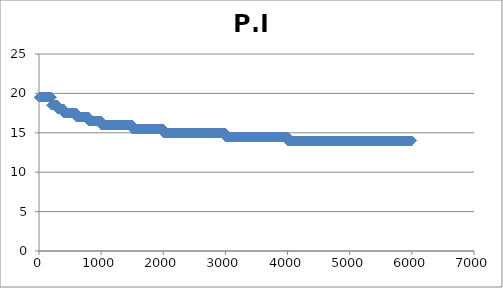
| Category | P.I |
|---|---|
| 0.0 | 19.5 |
| 1.0 | 19.5 |
| 2.0 | 19.5 |
| 3.0 | 19.5 |
| 4.0 | 19.5 |
| 5.0 | 19.5 |
| 6.0 | 19.5 |
| 7.0 | 19.5 |
| 8.0 | 19.5 |
| 9.0 | 19.5 |
| 10.0 | 19.5 |
| 11.0 | 19.5 |
| 12.0 | 19.5 |
| 13.0 | 19.5 |
| 14.0 | 19.5 |
| 15.0 | 19.5 |
| 16.0 | 19.5 |
| 17.0 | 19.5 |
| 18.0 | 19.5 |
| 19.0 | 19.5 |
| 20.0 | 19.5 |
| 21.0 | 19.5 |
| 22.0 | 19.5 |
| 23.0 | 19.5 |
| 24.0 | 19.5 |
| 25.0 | 19.5 |
| 26.0 | 19.5 |
| 27.0 | 19.5 |
| 28.0 | 19.5 |
| 29.0 | 19.5 |
| 30.0 | 19.5 |
| 31.0 | 19.5 |
| 32.0 | 19.5 |
| 33.0 | 19.5 |
| 34.0 | 19.5 |
| 35.0 | 19.5 |
| 36.0 | 19.5 |
| 37.0 | 19.5 |
| 38.0 | 19.5 |
| 39.0 | 19.5 |
| 40.0 | 19.5 |
| 41.0 | 19.5 |
| 42.0 | 19.5 |
| 43.0 | 19.5 |
| 44.0 | 19.5 |
| 45.0 | 19.5 |
| 46.0 | 19.5 |
| 47.0 | 19.5 |
| 48.0 | 19.5 |
| 49.0 | 19.5 |
| 50.0 | 19.5 |
| 51.0 | 19.5 |
| 52.0 | 19.5 |
| 53.0 | 19.5 |
| 54.0 | 19.5 |
| 55.0 | 19.5 |
| 56.0 | 19.5 |
| 57.0 | 19.5 |
| 58.0 | 19.5 |
| 59.0 | 19.5 |
| 60.0 | 19.5 |
| 61.0 | 19.5 |
| 62.0 | 19.5 |
| 63.0 | 19.5 |
| 64.0 | 19.5 |
| 65.0 | 19.5 |
| 66.0 | 19.5 |
| 67.0 | 19.5 |
| 68.0 | 19.5 |
| 69.0 | 19.5 |
| 70.0 | 19.5 |
| 71.0 | 19.5 |
| 72.0 | 19.5 |
| 73.0 | 19.5 |
| 74.0 | 19.5 |
| 75.0 | 19.5 |
| 76.0 | 19.5 |
| 77.0 | 19.5 |
| 78.0 | 19.5 |
| 79.0 | 19.5 |
| 80.0 | 19.5 |
| 81.0 | 19.5 |
| 82.0 | 19.5 |
| 83.0 | 19.5 |
| 84.0 | 19.5 |
| 85.0 | 19.5 |
| 86.0 | 19.5 |
| 87.0 | 19.5 |
| 88.0 | 19.5 |
| 89.0 | 19.5 |
| 90.0 | 19.5 |
| 91.0 | 19.5 |
| 92.0 | 19.5 |
| 93.0 | 19.5 |
| 94.0 | 19.5 |
| 95.0 | 19.5 |
| 96.0 | 19.5 |
| 97.0 | 19.5 |
| 98.0 | 19.5 |
| 99.0 | 19.5 |
| 100.0 | 19.5 |
| 101.0 | 19.5 |
| 102.0 | 19.5 |
| 103.0 | 19.5 |
| 104.0 | 19.5 |
| 105.0 | 19.5 |
| 106.0 | 19.5 |
| 107.0 | 19.5 |
| 108.0 | 19.5 |
| 109.0 | 19.5 |
| 110.0 | 19.5 |
| 111.0 | 19.5 |
| 112.0 | 19.5 |
| 113.0 | 19.5 |
| 114.0 | 19.5 |
| 115.0 | 19.5 |
| 116.0 | 19.5 |
| 117.0 | 19.5 |
| 118.0 | 19.5 |
| 119.0 | 19.5 |
| 120.0 | 19.5 |
| 121.0 | 19.5 |
| 122.0 | 19.5 |
| 123.0 | 19.5 |
| 124.0 | 19.5 |
| 125.0 | 19.5 |
| 126.0 | 19.5 |
| 127.0 | 19.5 |
| 128.0 | 19.5 |
| 129.0 | 19.5 |
| 130.0 | 19.5 |
| 131.0 | 19.5 |
| 132.0 | 19.5 |
| 133.0 | 19.5 |
| 134.0 | 19.5 |
| 135.0 | 19.5 |
| 136.0 | 19.5 |
| 137.0 | 19.5 |
| 138.0 | 19.5 |
| 139.0 | 19.5 |
| 140.0 | 19.5 |
| 141.0 | 19.5 |
| 142.0 | 19.5 |
| 143.0 | 19.5 |
| 144.0 | 19.5 |
| 145.0 | 19.5 |
| 146.0 | 19.5 |
| 147.0 | 19.5 |
| 148.0 | 19.5 |
| 149.0 | 19.5 |
| 150.0 | 19.5 |
| 151.0 | 19.5 |
| 152.0 | 19.5 |
| 153.0 | 19.5 |
| 154.0 | 19.5 |
| 155.0 | 19.5 |
| 156.0 | 19.5 |
| 157.0 | 19.5 |
| 158.0 | 19.5 |
| 159.0 | 19.5 |
| 160.0 | 19.5 |
| 161.0 | 19.5 |
| 162.0 | 19.5 |
| 163.0 | 19.5 |
| 164.0 | 19.5 |
| 165.0 | 19.5 |
| 166.0 | 19.5 |
| 167.0 | 19.5 |
| 168.0 | 19.5 |
| 169.0 | 19.5 |
| 170.0 | 19.5 |
| 171.0 | 19.5 |
| 172.0 | 19.5 |
| 173.0 | 19.5 |
| 174.0 | 19.5 |
| 175.0 | 19.5 |
| 176.0 | 19.5 |
| 177.0 | 19.5 |
| 178.0 | 19.5 |
| 179.0 | 19.5 |
| 180.0 | 19.5 |
| 181.0 | 19.5 |
| 182.0 | 19.5 |
| 183.0 | 19.5 |
| 184.0 | 19.5 |
| 185.0 | 19.5 |
| 186.0 | 19.5 |
| 187.0 | 19.5 |
| 188.0 | 19.5 |
| 189.0 | 19.5 |
| 190.0 | 19.5 |
| 191.0 | 19.5 |
| 192.0 | 19.5 |
| 193.0 | 19.5 |
| 194.0 | 19.5 |
| 195.0 | 19.5 |
| 196.0 | 19.5 |
| 197.0 | 19.5 |
| 198.0 | 19.5 |
| 199.0 | 19.5 |
| 200.0 | 19.5 |
| 201.0 | 18.5 |
| 202.0 | 18.5 |
| 203.0 | 18.5 |
| 204.0 | 18.5 |
| 205.0 | 18.5 |
| 206.0 | 18.5 |
| 207.0 | 18.5 |
| 208.0 | 18.5 |
| 209.0 | 18.5 |
| 210.0 | 18.5 |
| 211.0 | 18.5 |
| 212.0 | 18.5 |
| 213.0 | 18.5 |
| 214.0 | 18.5 |
| 215.0 | 18.5 |
| 216.0 | 18.5 |
| 217.0 | 18.5 |
| 218.0 | 18.5 |
| 219.0 | 18.5 |
| 220.0 | 18.5 |
| 221.0 | 18.5 |
| 222.0 | 18.5 |
| 223.0 | 18.5 |
| 224.0 | 18.5 |
| 225.0 | 18.5 |
| 226.0 | 18.5 |
| 227.0 | 18.5 |
| 228.0 | 18.5 |
| 229.0 | 18.5 |
| 230.0 | 18.5 |
| 231.0 | 18.5 |
| 232.0 | 18.5 |
| 233.0 | 18.5 |
| 234.0 | 18.5 |
| 235.0 | 18.5 |
| 236.0 | 18.5 |
| 237.0 | 18.5 |
| 238.0 | 18.5 |
| 239.0 | 18.5 |
| 240.0 | 18.5 |
| 241.0 | 18.5 |
| 242.0 | 18.5 |
| 243.0 | 18.5 |
| 244.0 | 18.5 |
| 245.0 | 18.5 |
| 246.0 | 18.5 |
| 247.0 | 18.5 |
| 248.0 | 18.5 |
| 249.0 | 18.5 |
| 250.0 | 18.5 |
| 251.0 | 18.5 |
| 252.0 | 18.5 |
| 253.0 | 18.5 |
| 254.0 | 18.5 |
| 255.0 | 18.5 |
| 256.0 | 18.5 |
| 257.0 | 18.5 |
| 258.0 | 18.5 |
| 259.0 | 18.5 |
| 260.0 | 18.5 |
| 261.0 | 18.5 |
| 262.0 | 18.5 |
| 263.0 | 18.5 |
| 264.0 | 18.5 |
| 265.0 | 18.5 |
| 266.0 | 18.5 |
| 267.0 | 18.5 |
| 268.0 | 18.5 |
| 269.0 | 18.5 |
| 270.0 | 18.5 |
| 271.0 | 18.5 |
| 272.0 | 18.5 |
| 273.0 | 18.5 |
| 274.0 | 18.5 |
| 275.0 | 18.5 |
| 276.0 | 18.5 |
| 277.0 | 18.5 |
| 278.0 | 18.5 |
| 279.0 | 18.5 |
| 280.0 | 18.5 |
| 281.0 | 18.5 |
| 282.0 | 18.5 |
| 283.0 | 18.5 |
| 284.0 | 18.5 |
| 285.0 | 18.5 |
| 286.0 | 18.5 |
| 287.0 | 18.5 |
| 288.0 | 18.5 |
| 289.0 | 18.5 |
| 290.0 | 18.5 |
| 291.0 | 18.5 |
| 292.0 | 18.5 |
| 293.0 | 18.5 |
| 294.0 | 18.5 |
| 295.0 | 18.5 |
| 296.0 | 18.5 |
| 297.0 | 18.5 |
| 298.0 | 18.5 |
| 299.0 | 18.5 |
| 300.0 | 18.5 |
| 301.0 | 18 |
| 302.0 | 18 |
| 303.0 | 18 |
| 304.0 | 18 |
| 305.0 | 18 |
| 306.0 | 18 |
| 307.0 | 18 |
| 308.0 | 18 |
| 309.0 | 18 |
| 310.0 | 18 |
| 311.0 | 18 |
| 312.0 | 18 |
| 313.0 | 18 |
| 314.0 | 18 |
| 315.0 | 18 |
| 316.0 | 18 |
| 317.0 | 18 |
| 318.0 | 18 |
| 319.0 | 18 |
| 320.0 | 18 |
| 321.0 | 18 |
| 322.0 | 18 |
| 323.0 | 18 |
| 324.0 | 18 |
| 325.0 | 18 |
| 326.0 | 18 |
| 327.0 | 18 |
| 328.0 | 18 |
| 329.0 | 18 |
| 330.0 | 18 |
| 331.0 | 18 |
| 332.0 | 18 |
| 333.0 | 18 |
| 334.0 | 18 |
| 335.0 | 18 |
| 336.0 | 18 |
| 337.0 | 18 |
| 338.0 | 18 |
| 339.0 | 18 |
| 340.0 | 18 |
| 341.0 | 18 |
| 342.0 | 18 |
| 343.0 | 18 |
| 344.0 | 18 |
| 345.0 | 18 |
| 346.0 | 18 |
| 347.0 | 18 |
| 348.0 | 18 |
| 349.0 | 18 |
| 350.0 | 18 |
| 351.0 | 18 |
| 352.0 | 18 |
| 353.0 | 18 |
| 354.0 | 18 |
| 355.0 | 18 |
| 356.0 | 18 |
| 357.0 | 18 |
| 358.0 | 18 |
| 359.0 | 18 |
| 360.0 | 18 |
| 361.0 | 18 |
| 362.0 | 18 |
| 363.0 | 18 |
| 364.0 | 18 |
| 365.0 | 18 |
| 366.0 | 18 |
| 367.0 | 18 |
| 368.0 | 18 |
| 369.0 | 18 |
| 370.0 | 18 |
| 371.0 | 18 |
| 372.0 | 18 |
| 373.0 | 18 |
| 374.0 | 18 |
| 375.0 | 18 |
| 376.0 | 18 |
| 377.0 | 18 |
| 378.0 | 18 |
| 379.0 | 18 |
| 380.0 | 18 |
| 381.0 | 18 |
| 382.0 | 18 |
| 383.0 | 18 |
| 384.0 | 18 |
| 385.0 | 18 |
| 386.0 | 18 |
| 387.0 | 18 |
| 388.0 | 18 |
| 389.0 | 18 |
| 390.0 | 18 |
| 391.0 | 18 |
| 392.0 | 18 |
| 393.0 | 18 |
| 394.0 | 18 |
| 395.0 | 18 |
| 396.0 | 18 |
| 397.0 | 18 |
| 398.0 | 18 |
| 399.0 | 18 |
| 400.0 | 18 |
| 401.0 | 17.5 |
| 402.0 | 17.5 |
| 403.0 | 17.5 |
| 404.0 | 17.5 |
| 405.0 | 17.5 |
| 406.0 | 17.5 |
| 407.0 | 17.5 |
| 408.0 | 17.5 |
| 409.0 | 17.5 |
| 410.0 | 17.5 |
| 411.0 | 17.5 |
| 412.0 | 17.5 |
| 413.0 | 17.5 |
| 414.0 | 17.5 |
| 415.0 | 17.5 |
| 416.0 | 17.5 |
| 417.0 | 17.5 |
| 418.0 | 17.5 |
| 419.0 | 17.5 |
| 420.0 | 17.5 |
| 421.0 | 17.5 |
| 422.0 | 17.5 |
| 423.0 | 17.5 |
| 424.0 | 17.5 |
| 425.0 | 17.5 |
| 426.0 | 17.5 |
| 427.0 | 17.5 |
| 428.0 | 17.5 |
| 429.0 | 17.5 |
| 430.0 | 17.5 |
| 431.0 | 17.5 |
| 432.0 | 17.5 |
| 433.0 | 17.5 |
| 434.0 | 17.5 |
| 435.0 | 17.5 |
| 436.0 | 17.5 |
| 437.0 | 17.5 |
| 438.0 | 17.5 |
| 439.0 | 17.5 |
| 440.0 | 17.5 |
| 441.0 | 17.5 |
| 442.0 | 17.5 |
| 443.0 | 17.5 |
| 444.0 | 17.5 |
| 445.0 | 17.5 |
| 446.0 | 17.5 |
| 447.0 | 17.5 |
| 448.0 | 17.5 |
| 449.0 | 17.5 |
| 450.0 | 17.5 |
| 451.0 | 17.5 |
| 452.0 | 17.5 |
| 453.0 | 17.5 |
| 454.0 | 17.5 |
| 455.0 | 17.5 |
| 456.0 | 17.5 |
| 457.0 | 17.5 |
| 458.0 | 17.5 |
| 459.0 | 17.5 |
| 460.0 | 17.5 |
| 461.0 | 17.5 |
| 462.0 | 17.5 |
| 463.0 | 17.5 |
| 464.0 | 17.5 |
| 465.0 | 17.5 |
| 466.0 | 17.5 |
| 467.0 | 17.5 |
| 468.0 | 17.5 |
| 469.0 | 17.5 |
| 470.0 | 17.5 |
| 471.0 | 17.5 |
| 472.0 | 17.5 |
| 473.0 | 17.5 |
| 474.0 | 17.5 |
| 475.0 | 17.5 |
| 476.0 | 17.5 |
| 477.0 | 17.5 |
| 478.0 | 17.5 |
| 479.0 | 17.5 |
| 480.0 | 17.5 |
| 481.0 | 17.5 |
| 482.0 | 17.5 |
| 483.0 | 17.5 |
| 484.0 | 17.5 |
| 485.0 | 17.5 |
| 486.0 | 17.5 |
| 487.0 | 17.5 |
| 488.0 | 17.5 |
| 489.0 | 17.5 |
| 490.0 | 17.5 |
| 491.0 | 17.5 |
| 492.0 | 17.5 |
| 493.0 | 17.5 |
| 494.0 | 17.5 |
| 495.0 | 17.5 |
| 496.0 | 17.5 |
| 497.0 | 17.5 |
| 498.0 | 17.5 |
| 499.0 | 17.5 |
| 500.0 | 17.5 |
| 501.0 | 17.5 |
| 502.0 | 17.5 |
| 503.0 | 17.5 |
| 504.0 | 17.5 |
| 505.0 | 17.5 |
| 506.0 | 17.5 |
| 507.0 | 17.5 |
| 508.0 | 17.5 |
| 509.0 | 17.5 |
| 510.0 | 17.5 |
| 511.0 | 17.5 |
| 512.0 | 17.5 |
| 513.0 | 17.5 |
| 514.0 | 17.5 |
| 515.0 | 17.5 |
| 516.0 | 17.5 |
| 517.0 | 17.5 |
| 518.0 | 17.5 |
| 519.0 | 17.5 |
| 520.0 | 17.5 |
| 521.0 | 17.5 |
| 522.0 | 17.5 |
| 523.0 | 17.5 |
| 524.0 | 17.5 |
| 525.0 | 17.5 |
| 526.0 | 17.5 |
| 527.0 | 17.5 |
| 528.0 | 17.5 |
| 529.0 | 17.5 |
| 530.0 | 17.5 |
| 531.0 | 17.5 |
| 532.0 | 17.5 |
| 533.0 | 17.5 |
| 534.0 | 17.5 |
| 535.0 | 17.5 |
| 536.0 | 17.5 |
| 537.0 | 17.5 |
| 538.0 | 17.5 |
| 539.0 | 17.5 |
| 540.0 | 17.5 |
| 541.0 | 17.5 |
| 542.0 | 17.5 |
| 543.0 | 17.5 |
| 544.0 | 17.5 |
| 545.0 | 17.5 |
| 546.0 | 17.5 |
| 547.0 | 17.5 |
| 548.0 | 17.5 |
| 549.0 | 17.5 |
| 550.0 | 17.5 |
| 551.0 | 17.5 |
| 552.0 | 17.5 |
| 553.0 | 17.5 |
| 554.0 | 17.5 |
| 555.0 | 17.5 |
| 556.0 | 17.5 |
| 557.0 | 17.5 |
| 558.0 | 17.5 |
| 559.0 | 17.5 |
| 560.0 | 17.5 |
| 561.0 | 17.5 |
| 562.0 | 17.5 |
| 563.0 | 17.5 |
| 564.0 | 17.5 |
| 565.0 | 17.5 |
| 566.0 | 17.5 |
| 567.0 | 17.5 |
| 568.0 | 17.5 |
| 569.0 | 17.5 |
| 570.0 | 17.5 |
| 571.0 | 17.5 |
| 572.0 | 17.5 |
| 573.0 | 17.5 |
| 574.0 | 17.5 |
| 575.0 | 17.5 |
| 576.0 | 17.5 |
| 577.0 | 17.5 |
| 578.0 | 17.5 |
| 579.0 | 17.5 |
| 580.0 | 17.5 |
| 581.0 | 17.5 |
| 582.0 | 17.5 |
| 583.0 | 17.5 |
| 584.0 | 17.5 |
| 585.0 | 17.5 |
| 586.0 | 17.5 |
| 587.0 | 17.5 |
| 588.0 | 17.5 |
| 589.0 | 17.5 |
| 590.0 | 17.5 |
| 591.0 | 17.5 |
| 592.0 | 17.5 |
| 593.0 | 17.5 |
| 594.0 | 17.5 |
| 595.0 | 17.5 |
| 596.0 | 17.5 |
| 597.0 | 17.5 |
| 598.0 | 17.5 |
| 599.0 | 17.5 |
| 600.0 | 17.5 |
| 601.0 | 17 |
| 602.0 | 17 |
| 603.0 | 17 |
| 604.0 | 17 |
| 605.0 | 17 |
| 606.0 | 17 |
| 607.0 | 17 |
| 608.0 | 17 |
| 609.0 | 17 |
| 610.0 | 17 |
| 611.0 | 17 |
| 612.0 | 17 |
| 613.0 | 17 |
| 614.0 | 17 |
| 615.0 | 17 |
| 616.0 | 17 |
| 617.0 | 17 |
| 618.0 | 17 |
| 619.0 | 17 |
| 620.0 | 17 |
| 621.0 | 17 |
| 622.0 | 17 |
| 623.0 | 17 |
| 624.0 | 17 |
| 625.0 | 17 |
| 626.0 | 17 |
| 627.0 | 17 |
| 628.0 | 17 |
| 629.0 | 17 |
| 630.0 | 17 |
| 631.0 | 17 |
| 632.0 | 17 |
| 633.0 | 17 |
| 634.0 | 17 |
| 635.0 | 17 |
| 636.0 | 17 |
| 637.0 | 17 |
| 638.0 | 17 |
| 639.0 | 17 |
| 640.0 | 17 |
| 641.0 | 17 |
| 642.0 | 17 |
| 643.0 | 17 |
| 644.0 | 17 |
| 645.0 | 17 |
| 646.0 | 17 |
| 647.0 | 17 |
| 648.0 | 17 |
| 649.0 | 17 |
| 650.0 | 17 |
| 651.0 | 17 |
| 652.0 | 17 |
| 653.0 | 17 |
| 654.0 | 17 |
| 655.0 | 17 |
| 656.0 | 17 |
| 657.0 | 17 |
| 658.0 | 17 |
| 659.0 | 17 |
| 660.0 | 17 |
| 661.0 | 17 |
| 662.0 | 17 |
| 663.0 | 17 |
| 664.0 | 17 |
| 665.0 | 17 |
| 666.0 | 17 |
| 667.0 | 17 |
| 668.0 | 17 |
| 669.0 | 17 |
| 670.0 | 17 |
| 671.0 | 17 |
| 672.0 | 17 |
| 673.0 | 17 |
| 674.0 | 17 |
| 675.0 | 17 |
| 676.0 | 17 |
| 677.0 | 17 |
| 678.0 | 17 |
| 679.0 | 17 |
| 680.0 | 17 |
| 681.0 | 17 |
| 682.0 | 17 |
| 683.0 | 17 |
| 684.0 | 17 |
| 685.0 | 17 |
| 686.0 | 17 |
| 687.0 | 17 |
| 688.0 | 17 |
| 689.0 | 17 |
| 690.0 | 17 |
| 691.0 | 17 |
| 692.0 | 17 |
| 693.0 | 17 |
| 694.0 | 17 |
| 695.0 | 17 |
| 696.0 | 17 |
| 697.0 | 17 |
| 698.0 | 17 |
| 699.0 | 17 |
| 700.0 | 17 |
| 701.0 | 17 |
| 702.0 | 17 |
| 703.0 | 17 |
| 704.0 | 17 |
| 705.0 | 17 |
| 706.0 | 17 |
| 707.0 | 17 |
| 708.0 | 17 |
| 709.0 | 17 |
| 710.0 | 17 |
| 711.0 | 17 |
| 712.0 | 17 |
| 713.0 | 17 |
| 714.0 | 17 |
| 715.0 | 17 |
| 716.0 | 17 |
| 717.0 | 17 |
| 718.0 | 17 |
| 719.0 | 17 |
| 720.0 | 17 |
| 721.0 | 17 |
| 722.0 | 17 |
| 723.0 | 17 |
| 724.0 | 17 |
| 725.0 | 17 |
| 726.0 | 17 |
| 727.0 | 17 |
| 728.0 | 17 |
| 729.0 | 17 |
| 730.0 | 17 |
| 731.0 | 17 |
| 732.0 | 17 |
| 733.0 | 17 |
| 734.0 | 17 |
| 735.0 | 17 |
| 736.0 | 17 |
| 737.0 | 17 |
| 738.0 | 17 |
| 739.0 | 17 |
| 740.0 | 17 |
| 741.0 | 17 |
| 742.0 | 17 |
| 743.0 | 17 |
| 744.0 | 17 |
| 745.0 | 17 |
| 746.0 | 17 |
| 747.0 | 17 |
| 748.0 | 17 |
| 749.0 | 17 |
| 750.0 | 17 |
| 751.0 | 17 |
| 752.0 | 17 |
| 753.0 | 17 |
| 754.0 | 17 |
| 755.0 | 17 |
| 756.0 | 17 |
| 757.0 | 17 |
| 758.0 | 17 |
| 759.0 | 17 |
| 760.0 | 17 |
| 761.0 | 17 |
| 762.0 | 17 |
| 763.0 | 17 |
| 764.0 | 17 |
| 765.0 | 17 |
| 766.0 | 17 |
| 767.0 | 17 |
| 768.0 | 17 |
| 769.0 | 17 |
| 770.0 | 17 |
| 771.0 | 17 |
| 772.0 | 17 |
| 773.0 | 17 |
| 774.0 | 17 |
| 775.0 | 17 |
| 776.0 | 17 |
| 777.0 | 17 |
| 778.0 | 17 |
| 779.0 | 17 |
| 780.0 | 17 |
| 781.0 | 17 |
| 782.0 | 17 |
| 783.0 | 17 |
| 784.0 | 17 |
| 785.0 | 17 |
| 786.0 | 17 |
| 787.0 | 17 |
| 788.0 | 17 |
| 789.0 | 17 |
| 790.0 | 17 |
| 791.0 | 17 |
| 792.0 | 17 |
| 793.0 | 17 |
| 794.0 | 17 |
| 795.0 | 17 |
| 796.0 | 17 |
| 797.0 | 17 |
| 798.0 | 17 |
| 799.0 | 17 |
| 800.0 | 17 |
| 801.0 | 16.5 |
| 802.0 | 16.5 |
| 803.0 | 16.5 |
| 804.0 | 16.5 |
| 805.0 | 16.5 |
| 806.0 | 16.5 |
| 807.0 | 16.5 |
| 808.0 | 16.5 |
| 809.0 | 16.5 |
| 810.0 | 16.5 |
| 811.0 | 16.5 |
| 812.0 | 16.5 |
| 813.0 | 16.5 |
| 814.0 | 16.5 |
| 815.0 | 16.5 |
| 816.0 | 16.5 |
| 817.0 | 16.5 |
| 818.0 | 16.5 |
| 819.0 | 16.5 |
| 820.0 | 16.5 |
| 821.0 | 16.5 |
| 822.0 | 16.5 |
| 823.0 | 16.5 |
| 824.0 | 16.5 |
| 825.0 | 16.5 |
| 826.0 | 16.5 |
| 827.0 | 16.5 |
| 828.0 | 16.5 |
| 829.0 | 16.5 |
| 830.0 | 16.5 |
| 831.0 | 16.5 |
| 832.0 | 16.5 |
| 833.0 | 16.5 |
| 834.0 | 16.5 |
| 835.0 | 16.5 |
| 836.0 | 16.5 |
| 837.0 | 16.5 |
| 838.0 | 16.5 |
| 839.0 | 16.5 |
| 840.0 | 16.5 |
| 841.0 | 16.5 |
| 842.0 | 16.5 |
| 843.0 | 16.5 |
| 844.0 | 16.5 |
| 845.0 | 16.5 |
| 846.0 | 16.5 |
| 847.0 | 16.5 |
| 848.0 | 16.5 |
| 849.0 | 16.5 |
| 850.0 | 16.5 |
| 851.0 | 16.5 |
| 852.0 | 16.5 |
| 853.0 | 16.5 |
| 854.0 | 16.5 |
| 855.0 | 16.5 |
| 856.0 | 16.5 |
| 857.0 | 16.5 |
| 858.0 | 16.5 |
| 859.0 | 16.5 |
| 860.0 | 16.5 |
| 861.0 | 16.5 |
| 862.0 | 16.5 |
| 863.0 | 16.5 |
| 864.0 | 16.5 |
| 865.0 | 16.5 |
| 866.0 | 16.5 |
| 867.0 | 16.5 |
| 868.0 | 16.5 |
| 869.0 | 16.5 |
| 870.0 | 16.5 |
| 871.0 | 16.5 |
| 872.0 | 16.5 |
| 873.0 | 16.5 |
| 874.0 | 16.5 |
| 875.0 | 16.5 |
| 876.0 | 16.5 |
| 877.0 | 16.5 |
| 878.0 | 16.5 |
| 879.0 | 16.5 |
| 880.0 | 16.5 |
| 881.0 | 16.5 |
| 882.0 | 16.5 |
| 883.0 | 16.5 |
| 884.0 | 16.5 |
| 885.0 | 16.5 |
| 886.0 | 16.5 |
| 887.0 | 16.5 |
| 888.0 | 16.5 |
| 889.0 | 16.5 |
| 890.0 | 16.5 |
| 891.0 | 16.5 |
| 892.0 | 16.5 |
| 893.0 | 16.5 |
| 894.0 | 16.5 |
| 895.0 | 16.5 |
| 896.0 | 16.5 |
| 897.0 | 16.5 |
| 898.0 | 16.5 |
| 899.0 | 16.5 |
| 900.0 | 16.5 |
| 901.0 | 16.5 |
| 902.0 | 16.5 |
| 903.0 | 16.5 |
| 904.0 | 16.5 |
| 905.0 | 16.5 |
| 906.0 | 16.5 |
| 907.0 | 16.5 |
| 908.0 | 16.5 |
| 909.0 | 16.5 |
| 910.0 | 16.5 |
| 911.0 | 16.5 |
| 912.0 | 16.5 |
| 913.0 | 16.5 |
| 914.0 | 16.5 |
| 915.0 | 16.5 |
| 916.0 | 16.5 |
| 917.0 | 16.5 |
| 918.0 | 16.5 |
| 919.0 | 16.5 |
| 920.0 | 16.5 |
| 921.0 | 16.5 |
| 922.0 | 16.5 |
| 923.0 | 16.5 |
| 924.0 | 16.5 |
| 925.0 | 16.5 |
| 926.0 | 16.5 |
| 927.0 | 16.5 |
| 928.0 | 16.5 |
| 929.0 | 16.5 |
| 930.0 | 16.5 |
| 931.0 | 16.5 |
| 932.0 | 16.5 |
| 933.0 | 16.5 |
| 934.0 | 16.5 |
| 935.0 | 16.5 |
| 936.0 | 16.5 |
| 937.0 | 16.5 |
| 938.0 | 16.5 |
| 939.0 | 16.5 |
| 940.0 | 16.5 |
| 941.0 | 16.5 |
| 942.0 | 16.5 |
| 943.0 | 16.5 |
| 944.0 | 16.5 |
| 945.0 | 16.5 |
| 946.0 | 16.5 |
| 947.0 | 16.5 |
| 948.0 | 16.5 |
| 949.0 | 16.5 |
| 950.0 | 16.5 |
| 951.0 | 16.5 |
| 952.0 | 16.5 |
| 953.0 | 16.5 |
| 954.0 | 16.5 |
| 955.0 | 16.5 |
| 956.0 | 16.5 |
| 957.0 | 16.5 |
| 958.0 | 16.5 |
| 959.0 | 16.5 |
| 960.0 | 16.5 |
| 961.0 | 16.5 |
| 962.0 | 16.5 |
| 963.0 | 16.5 |
| 964.0 | 16.5 |
| 965.0 | 16.5 |
| 966.0 | 16.5 |
| 967.0 | 16.5 |
| 968.0 | 16.5 |
| 969.0 | 16.5 |
| 970.0 | 16.5 |
| 971.0 | 16.5 |
| 972.0 | 16.5 |
| 973.0 | 16.5 |
| 974.0 | 16.5 |
| 975.0 | 16.5 |
| 976.0 | 16.5 |
| 977.0 | 16.5 |
| 978.0 | 16.5 |
| 979.0 | 16.5 |
| 980.0 | 16.5 |
| 981.0 | 16.5 |
| 982.0 | 16.5 |
| 983.0 | 16.5 |
| 984.0 | 16.5 |
| 985.0 | 16.5 |
| 986.0 | 16.5 |
| 987.0 | 16.5 |
| 988.0 | 16.5 |
| 989.0 | 16.5 |
| 990.0 | 16.5 |
| 991.0 | 16.5 |
| 992.0 | 16.5 |
| 993.0 | 16.5 |
| 994.0 | 16.5 |
| 995.0 | 16.5 |
| 996.0 | 16.5 |
| 997.0 | 16.5 |
| 998.0 | 16.5 |
| 999.0 | 16.5 |
| 1000.0 | 16.5 |
| 1001.0 | 16 |
| 1002.0 | 16 |
| 1003.0 | 16 |
| 1004.0 | 16 |
| 1005.0 | 16 |
| 1006.0 | 16 |
| 1007.0 | 16 |
| 1008.0 | 16 |
| 1009.0 | 16 |
| 1010.0 | 16 |
| 1011.0 | 16 |
| 1012.0 | 16 |
| 1013.0 | 16 |
| 1014.0 | 16 |
| 1015.0 | 16 |
| 1016.0 | 16 |
| 1017.0 | 16 |
| 1018.0 | 16 |
| 1019.0 | 16 |
| 1020.0 | 16 |
| 1021.0 | 16 |
| 1022.0 | 16 |
| 1023.0 | 16 |
| 1024.0 | 16 |
| 1025.0 | 16 |
| 1026.0 | 16 |
| 1027.0 | 16 |
| 1028.0 | 16 |
| 1029.0 | 16 |
| 1030.0 | 16 |
| 1031.0 | 16 |
| 1032.0 | 16 |
| 1033.0 | 16 |
| 1034.0 | 16 |
| 1035.0 | 16 |
| 1036.0 | 16 |
| 1037.0 | 16 |
| 1038.0 | 16 |
| 1039.0 | 16 |
| 1040.0 | 16 |
| 1041.0 | 16 |
| 1042.0 | 16 |
| 1043.0 | 16 |
| 1044.0 | 16 |
| 1045.0 | 16 |
| 1046.0 | 16 |
| 1047.0 | 16 |
| 1048.0 | 16 |
| 1049.0 | 16 |
| 1050.0 | 16 |
| 1051.0 | 16 |
| 1052.0 | 16 |
| 1053.0 | 16 |
| 1054.0 | 16 |
| 1055.0 | 16 |
| 1056.0 | 16 |
| 1057.0 | 16 |
| 1058.0 | 16 |
| 1059.0 | 16 |
| 1060.0 | 16 |
| 1061.0 | 16 |
| 1062.0 | 16 |
| 1063.0 | 16 |
| 1064.0 | 16 |
| 1065.0 | 16 |
| 1066.0 | 16 |
| 1067.0 | 16 |
| 1068.0 | 16 |
| 1069.0 | 16 |
| 1070.0 | 16 |
| 1071.0 | 16 |
| 1072.0 | 16 |
| 1073.0 | 16 |
| 1074.0 | 16 |
| 1075.0 | 16 |
| 1076.0 | 16 |
| 1077.0 | 16 |
| 1078.0 | 16 |
| 1079.0 | 16 |
| 1080.0 | 16 |
| 1081.0 | 16 |
| 1082.0 | 16 |
| 1083.0 | 16 |
| 1084.0 | 16 |
| 1085.0 | 16 |
| 1086.0 | 16 |
| 1087.0 | 16 |
| 1088.0 | 16 |
| 1089.0 | 16 |
| 1090.0 | 16 |
| 1091.0 | 16 |
| 1092.0 | 16 |
| 1093.0 | 16 |
| 1094.0 | 16 |
| 1095.0 | 16 |
| 1096.0 | 16 |
| 1097.0 | 16 |
| 1098.0 | 16 |
| 1099.0 | 16 |
| 1100.0 | 16 |
| 1101.0 | 16 |
| 1102.0 | 16 |
| 1103.0 | 16 |
| 1104.0 | 16 |
| 1105.0 | 16 |
| 1106.0 | 16 |
| 1107.0 | 16 |
| 1108.0 | 16 |
| 1109.0 | 16 |
| 1110.0 | 16 |
| 1111.0 | 16 |
| 1112.0 | 16 |
| 1113.0 | 16 |
| 1114.0 | 16 |
| 1115.0 | 16 |
| 1116.0 | 16 |
| 1117.0 | 16 |
| 1118.0 | 16 |
| 1119.0 | 16 |
| 1120.0 | 16 |
| 1121.0 | 16 |
| 1122.0 | 16 |
| 1123.0 | 16 |
| 1124.0 | 16 |
| 1125.0 | 16 |
| 1126.0 | 16 |
| 1127.0 | 16 |
| 1128.0 | 16 |
| 1129.0 | 16 |
| 1130.0 | 16 |
| 1131.0 | 16 |
| 1132.0 | 16 |
| 1133.0 | 16 |
| 1134.0 | 16 |
| 1135.0 | 16 |
| 1136.0 | 16 |
| 1137.0 | 16 |
| 1138.0 | 16 |
| 1139.0 | 16 |
| 1140.0 | 16 |
| 1141.0 | 16 |
| 1142.0 | 16 |
| 1143.0 | 16 |
| 1144.0 | 16 |
| 1145.0 | 16 |
| 1146.0 | 16 |
| 1147.0 | 16 |
| 1148.0 | 16 |
| 1149.0 | 16 |
| 1150.0 | 16 |
| 1151.0 | 16 |
| 1152.0 | 16 |
| 1153.0 | 16 |
| 1154.0 | 16 |
| 1155.0 | 16 |
| 1156.0 | 16 |
| 1157.0 | 16 |
| 1158.0 | 16 |
| 1159.0 | 16 |
| 1160.0 | 16 |
| 1161.0 | 16 |
| 1162.0 | 16 |
| 1163.0 | 16 |
| 1164.0 | 16 |
| 1165.0 | 16 |
| 1166.0 | 16 |
| 1167.0 | 16 |
| 1168.0 | 16 |
| 1169.0 | 16 |
| 1170.0 | 16 |
| 1171.0 | 16 |
| 1172.0 | 16 |
| 1173.0 | 16 |
| 1174.0 | 16 |
| 1175.0 | 16 |
| 1176.0 | 16 |
| 1177.0 | 16 |
| 1178.0 | 16 |
| 1179.0 | 16 |
| 1180.0 | 16 |
| 1181.0 | 16 |
| 1182.0 | 16 |
| 1183.0 | 16 |
| 1184.0 | 16 |
| 1185.0 | 16 |
| 1186.0 | 16 |
| 1187.0 | 16 |
| 1188.0 | 16 |
| 1189.0 | 16 |
| 1190.0 | 16 |
| 1191.0 | 16 |
| 1192.0 | 16 |
| 1193.0 | 16 |
| 1194.0 | 16 |
| 1195.0 | 16 |
| 1196.0 | 16 |
| 1197.0 | 16 |
| 1198.0 | 16 |
| 1199.0 | 16 |
| 1200.0 | 16 |
| 1201.0 | 16 |
| 1202.0 | 16 |
| 1203.0 | 16 |
| 1204.0 | 16 |
| 1205.0 | 16 |
| 1206.0 | 16 |
| 1207.0 | 16 |
| 1208.0 | 16 |
| 1209.0 | 16 |
| 1210.0 | 16 |
| 1211.0 | 16 |
| 1212.0 | 16 |
| 1213.0 | 16 |
| 1214.0 | 16 |
| 1215.0 | 16 |
| 1216.0 | 16 |
| 1217.0 | 16 |
| 1218.0 | 16 |
| 1219.0 | 16 |
| 1220.0 | 16 |
| 1221.0 | 16 |
| 1222.0 | 16 |
| 1223.0 | 16 |
| 1224.0 | 16 |
| 1225.0 | 16 |
| 1226.0 | 16 |
| 1227.0 | 16 |
| 1228.0 | 16 |
| 1229.0 | 16 |
| 1230.0 | 16 |
| 1231.0 | 16 |
| 1232.0 | 16 |
| 1233.0 | 16 |
| 1234.0 | 16 |
| 1235.0 | 16 |
| 1236.0 | 16 |
| 1237.0 | 16 |
| 1238.0 | 16 |
| 1239.0 | 16 |
| 1240.0 | 16 |
| 1241.0 | 16 |
| 1242.0 | 16 |
| 1243.0 | 16 |
| 1244.0 | 16 |
| 1245.0 | 16 |
| 1246.0 | 16 |
| 1247.0 | 16 |
| 1248.0 | 16 |
| 1249.0 | 16 |
| 1250.0 | 16 |
| 1251.0 | 16 |
| 1252.0 | 16 |
| 1253.0 | 16 |
| 1254.0 | 16 |
| 1255.0 | 16 |
| 1256.0 | 16 |
| 1257.0 | 16 |
| 1258.0 | 16 |
| 1259.0 | 16 |
| 1260.0 | 16 |
| 1261.0 | 16 |
| 1262.0 | 16 |
| 1263.0 | 16 |
| 1264.0 | 16 |
| 1265.0 | 16 |
| 1266.0 | 16 |
| 1267.0 | 16 |
| 1268.0 | 16 |
| 1269.0 | 16 |
| 1270.0 | 16 |
| 1271.0 | 16 |
| 1272.0 | 16 |
| 1273.0 | 16 |
| 1274.0 | 16 |
| 1275.0 | 16 |
| 1276.0 | 16 |
| 1277.0 | 16 |
| 1278.0 | 16 |
| 1279.0 | 16 |
| 1280.0 | 16 |
| 1281.0 | 16 |
| 1282.0 | 16 |
| 1283.0 | 16 |
| 1284.0 | 16 |
| 1285.0 | 16 |
| 1286.0 | 16 |
| 1287.0 | 16 |
| 1288.0 | 16 |
| 1289.0 | 16 |
| 1290.0 | 16 |
| 1291.0 | 16 |
| 1292.0 | 16 |
| 1293.0 | 16 |
| 1294.0 | 16 |
| 1295.0 | 16 |
| 1296.0 | 16 |
| 1297.0 | 16 |
| 1298.0 | 16 |
| 1299.0 | 16 |
| 1300.0 | 16 |
| 1301.0 | 16 |
| 1302.0 | 16 |
| 1303.0 | 16 |
| 1304.0 | 16 |
| 1305.0 | 16 |
| 1306.0 | 16 |
| 1307.0 | 16 |
| 1308.0 | 16 |
| 1309.0 | 16 |
| 1310.0 | 16 |
| 1311.0 | 16 |
| 1312.0 | 16 |
| 1313.0 | 16 |
| 1314.0 | 16 |
| 1315.0 | 16 |
| 1316.0 | 16 |
| 1317.0 | 16 |
| 1318.0 | 16 |
| 1319.0 | 16 |
| 1320.0 | 16 |
| 1321.0 | 16 |
| 1322.0 | 16 |
| 1323.0 | 16 |
| 1324.0 | 16 |
| 1325.0 | 16 |
| 1326.0 | 16 |
| 1327.0 | 16 |
| 1328.0 | 16 |
| 1329.0 | 16 |
| 1330.0 | 16 |
| 1331.0 | 16 |
| 1332.0 | 16 |
| 1333.0 | 16 |
| 1334.0 | 16 |
| 1335.0 | 16 |
| 1336.0 | 16 |
| 1337.0 | 16 |
| 1338.0 | 16 |
| 1339.0 | 16 |
| 1340.0 | 16 |
| 1341.0 | 16 |
| 1342.0 | 16 |
| 1343.0 | 16 |
| 1344.0 | 16 |
| 1345.0 | 16 |
| 1346.0 | 16 |
| 1347.0 | 16 |
| 1348.0 | 16 |
| 1349.0 | 16 |
| 1350.0 | 16 |
| 1351.0 | 16 |
| 1352.0 | 16 |
| 1353.0 | 16 |
| 1354.0 | 16 |
| 1355.0 | 16 |
| 1356.0 | 16 |
| 1357.0 | 16 |
| 1358.0 | 16 |
| 1359.0 | 16 |
| 1360.0 | 16 |
| 1361.0 | 16 |
| 1362.0 | 16 |
| 1363.0 | 16 |
| 1364.0 | 16 |
| 1365.0 | 16 |
| 1366.0 | 16 |
| 1367.0 | 16 |
| 1368.0 | 16 |
| 1369.0 | 16 |
| 1370.0 | 16 |
| 1371.0 | 16 |
| 1372.0 | 16 |
| 1373.0 | 16 |
| 1374.0 | 16 |
| 1375.0 | 16 |
| 1376.0 | 16 |
| 1377.0 | 16 |
| 1378.0 | 16 |
| 1379.0 | 16 |
| 1380.0 | 16 |
| 1381.0 | 16 |
| 1382.0 | 16 |
| 1383.0 | 16 |
| 1384.0 | 16 |
| 1385.0 | 16 |
| 1386.0 | 16 |
| 1387.0 | 16 |
| 1388.0 | 16 |
| 1389.0 | 16 |
| 1390.0 | 16 |
| 1391.0 | 16 |
| 1392.0 | 16 |
| 1393.0 | 16 |
| 1394.0 | 16 |
| 1395.0 | 16 |
| 1396.0 | 16 |
| 1397.0 | 16 |
| 1398.0 | 16 |
| 1399.0 | 16 |
| 1400.0 | 16 |
| 1401.0 | 16 |
| 1402.0 | 16 |
| 1403.0 | 16 |
| 1404.0 | 16 |
| 1405.0 | 16 |
| 1406.0 | 16 |
| 1407.0 | 16 |
| 1408.0 | 16 |
| 1409.0 | 16 |
| 1410.0 | 16 |
| 1411.0 | 16 |
| 1412.0 | 16 |
| 1413.0 | 16 |
| 1414.0 | 16 |
| 1415.0 | 16 |
| 1416.0 | 16 |
| 1417.0 | 16 |
| 1418.0 | 16 |
| 1419.0 | 16 |
| 1420.0 | 16 |
| 1421.0 | 16 |
| 1422.0 | 16 |
| 1423.0 | 16 |
| 1424.0 | 16 |
| 1425.0 | 16 |
| 1426.0 | 16 |
| 1427.0 | 16 |
| 1428.0 | 16 |
| 1429.0 | 16 |
| 1430.0 | 16 |
| 1431.0 | 16 |
| 1432.0 | 16 |
| 1433.0 | 16 |
| 1434.0 | 16 |
| 1435.0 | 16 |
| 1436.0 | 16 |
| 1437.0 | 16 |
| 1438.0 | 16 |
| 1439.0 | 16 |
| 1440.0 | 16 |
| 1441.0 | 16 |
| 1442.0 | 16 |
| 1443.0 | 16 |
| 1444.0 | 16 |
| 1445.0 | 16 |
| 1446.0 | 16 |
| 1447.0 | 16 |
| 1448.0 | 16 |
| 1449.0 | 16 |
| 1450.0 | 16 |
| 1451.0 | 16 |
| 1452.0 | 16 |
| 1453.0 | 16 |
| 1454.0 | 16 |
| 1455.0 | 16 |
| 1456.0 | 16 |
| 1457.0 | 16 |
| 1458.0 | 16 |
| 1459.0 | 16 |
| 1460.0 | 16 |
| 1461.0 | 16 |
| 1462.0 | 16 |
| 1463.0 | 16 |
| 1464.0 | 16 |
| 1465.0 | 16 |
| 1466.0 | 16 |
| 1467.0 | 16 |
| 1468.0 | 16 |
| 1469.0 | 16 |
| 1470.0 | 16 |
| 1471.0 | 16 |
| 1472.0 | 16 |
| 1473.0 | 16 |
| 1474.0 | 16 |
| 1475.0 | 16 |
| 1476.0 | 16 |
| 1477.0 | 16 |
| 1478.0 | 16 |
| 1479.0 | 16 |
| 1480.0 | 16 |
| 1481.0 | 16 |
| 1482.0 | 16 |
| 1483.0 | 16 |
| 1484.0 | 16 |
| 1485.0 | 16 |
| 1486.0 | 16 |
| 1487.0 | 16 |
| 1488.0 | 16 |
| 1489.0 | 16 |
| 1490.0 | 16 |
| 1491.0 | 16 |
| 1492.0 | 16 |
| 1493.0 | 16 |
| 1494.0 | 16 |
| 1495.0 | 16 |
| 1496.0 | 16 |
| 1497.0 | 16 |
| 1498.0 | 16 |
| 1499.0 | 16 |
| 1500.0 | 16 |
| 1501.0 | 15.5 |
| 1502.0 | 15.5 |
| 1503.0 | 15.5 |
| 1504.0 | 15.5 |
| 1505.0 | 15.5 |
| 1506.0 | 15.5 |
| 1507.0 | 15.5 |
| 1508.0 | 15.5 |
| 1509.0 | 15.5 |
| 1510.0 | 15.5 |
| 1511.0 | 15.5 |
| 1512.0 | 15.5 |
| 1513.0 | 15.5 |
| 1514.0 | 15.5 |
| 1515.0 | 15.5 |
| 1516.0 | 15.5 |
| 1517.0 | 15.5 |
| 1518.0 | 15.5 |
| 1519.0 | 15.5 |
| 1520.0 | 15.5 |
| 1521.0 | 15.5 |
| 1522.0 | 15.5 |
| 1523.0 | 15.5 |
| 1524.0 | 15.5 |
| 1525.0 | 15.5 |
| 1526.0 | 15.5 |
| 1527.0 | 15.5 |
| 1528.0 | 15.5 |
| 1529.0 | 15.5 |
| 1530.0 | 15.5 |
| 1531.0 | 15.5 |
| 1532.0 | 15.5 |
| 1533.0 | 15.5 |
| 1534.0 | 15.5 |
| 1535.0 | 15.5 |
| 1536.0 | 15.5 |
| 1537.0 | 15.5 |
| 1538.0 | 15.5 |
| 1539.0 | 15.5 |
| 1540.0 | 15.5 |
| 1541.0 | 15.5 |
| 1542.0 | 15.5 |
| 1543.0 | 15.5 |
| 1544.0 | 15.5 |
| 1545.0 | 15.5 |
| 1546.0 | 15.5 |
| 1547.0 | 15.5 |
| 1548.0 | 15.5 |
| 1549.0 | 15.5 |
| 1550.0 | 15.5 |
| 1551.0 | 15.5 |
| 1552.0 | 15.5 |
| 1553.0 | 15.5 |
| 1554.0 | 15.5 |
| 1555.0 | 15.5 |
| 1556.0 | 15.5 |
| 1557.0 | 15.5 |
| 1558.0 | 15.5 |
| 1559.0 | 15.5 |
| 1560.0 | 15.5 |
| 1561.0 | 15.5 |
| 1562.0 | 15.5 |
| 1563.0 | 15.5 |
| 1564.0 | 15.5 |
| 1565.0 | 15.5 |
| 1566.0 | 15.5 |
| 1567.0 | 15.5 |
| 1568.0 | 15.5 |
| 1569.0 | 15.5 |
| 1570.0 | 15.5 |
| 1571.0 | 15.5 |
| 1572.0 | 15.5 |
| 1573.0 | 15.5 |
| 1574.0 | 15.5 |
| 1575.0 | 15.5 |
| 1576.0 | 15.5 |
| 1577.0 | 15.5 |
| 1578.0 | 15.5 |
| 1579.0 | 15.5 |
| 1580.0 | 15.5 |
| 1581.0 | 15.5 |
| 1582.0 | 15.5 |
| 1583.0 | 15.5 |
| 1584.0 | 15.5 |
| 1585.0 | 15.5 |
| 1586.0 | 15.5 |
| 1587.0 | 15.5 |
| 1588.0 | 15.5 |
| 1589.0 | 15.5 |
| 1590.0 | 15.5 |
| 1591.0 | 15.5 |
| 1592.0 | 15.5 |
| 1593.0 | 15.5 |
| 1594.0 | 15.5 |
| 1595.0 | 15.5 |
| 1596.0 | 15.5 |
| 1597.0 | 15.5 |
| 1598.0 | 15.5 |
| 1599.0 | 15.5 |
| 1600.0 | 15.5 |
| 1601.0 | 15.5 |
| 1602.0 | 15.5 |
| 1603.0 | 15.5 |
| 1604.0 | 15.5 |
| 1605.0 | 15.5 |
| 1606.0 | 15.5 |
| 1607.0 | 15.5 |
| 1608.0 | 15.5 |
| 1609.0 | 15.5 |
| 1610.0 | 15.5 |
| 1611.0 | 15.5 |
| 1612.0 | 15.5 |
| 1613.0 | 15.5 |
| 1614.0 | 15.5 |
| 1615.0 | 15.5 |
| 1616.0 | 15.5 |
| 1617.0 | 15.5 |
| 1618.0 | 15.5 |
| 1619.0 | 15.5 |
| 1620.0 | 15.5 |
| 1621.0 | 15.5 |
| 1622.0 | 15.5 |
| 1623.0 | 15.5 |
| 1624.0 | 15.5 |
| 1625.0 | 15.5 |
| 1626.0 | 15.5 |
| 1627.0 | 15.5 |
| 1628.0 | 15.5 |
| 1629.0 | 15.5 |
| 1630.0 | 15.5 |
| 1631.0 | 15.5 |
| 1632.0 | 15.5 |
| 1633.0 | 15.5 |
| 1634.0 | 15.5 |
| 1635.0 | 15.5 |
| 1636.0 | 15.5 |
| 1637.0 | 15.5 |
| 1638.0 | 15.5 |
| 1639.0 | 15.5 |
| 1640.0 | 15.5 |
| 1641.0 | 15.5 |
| 1642.0 | 15.5 |
| 1643.0 | 15.5 |
| 1644.0 | 15.5 |
| 1645.0 | 15.5 |
| 1646.0 | 15.5 |
| 1647.0 | 15.5 |
| 1648.0 | 15.5 |
| 1649.0 | 15.5 |
| 1650.0 | 15.5 |
| 1651.0 | 15.5 |
| 1652.0 | 15.5 |
| 1653.0 | 15.5 |
| 1654.0 | 15.5 |
| 1655.0 | 15.5 |
| 1656.0 | 15.5 |
| 1657.0 | 15.5 |
| 1658.0 | 15.5 |
| 1659.0 | 15.5 |
| 1660.0 | 15.5 |
| 1661.0 | 15.5 |
| 1662.0 | 15.5 |
| 1663.0 | 15.5 |
| 1664.0 | 15.5 |
| 1665.0 | 15.5 |
| 1666.0 | 15.5 |
| 1667.0 | 15.5 |
| 1668.0 | 15.5 |
| 1669.0 | 15.5 |
| 1670.0 | 15.5 |
| 1671.0 | 15.5 |
| 1672.0 | 15.5 |
| 1673.0 | 15.5 |
| 1674.0 | 15.5 |
| 1675.0 | 15.5 |
| 1676.0 | 15.5 |
| 1677.0 | 15.5 |
| 1678.0 | 15.5 |
| 1679.0 | 15.5 |
| 1680.0 | 15.5 |
| 1681.0 | 15.5 |
| 1682.0 | 15.5 |
| 1683.0 | 15.5 |
| 1684.0 | 15.5 |
| 1685.0 | 15.5 |
| 1686.0 | 15.5 |
| 1687.0 | 15.5 |
| 1688.0 | 15.5 |
| 1689.0 | 15.5 |
| 1690.0 | 15.5 |
| 1691.0 | 15.5 |
| 1692.0 | 15.5 |
| 1693.0 | 15.5 |
| 1694.0 | 15.5 |
| 1695.0 | 15.5 |
| 1696.0 | 15.5 |
| 1697.0 | 15.5 |
| 1698.0 | 15.5 |
| 1699.0 | 15.5 |
| 1700.0 | 15.5 |
| 1701.0 | 15.5 |
| 1702.0 | 15.5 |
| 1703.0 | 15.5 |
| 1704.0 | 15.5 |
| 1705.0 | 15.5 |
| 1706.0 | 15.5 |
| 1707.0 | 15.5 |
| 1708.0 | 15.5 |
| 1709.0 | 15.5 |
| 1710.0 | 15.5 |
| 1711.0 | 15.5 |
| 1712.0 | 15.5 |
| 1713.0 | 15.5 |
| 1714.0 | 15.5 |
| 1715.0 | 15.5 |
| 1716.0 | 15.5 |
| 1717.0 | 15.5 |
| 1718.0 | 15.5 |
| 1719.0 | 15.5 |
| 1720.0 | 15.5 |
| 1721.0 | 15.5 |
| 1722.0 | 15.5 |
| 1723.0 | 15.5 |
| 1724.0 | 15.5 |
| 1725.0 | 15.5 |
| 1726.0 | 15.5 |
| 1727.0 | 15.5 |
| 1728.0 | 15.5 |
| 1729.0 | 15.5 |
| 1730.0 | 15.5 |
| 1731.0 | 15.5 |
| 1732.0 | 15.5 |
| 1733.0 | 15.5 |
| 1734.0 | 15.5 |
| 1735.0 | 15.5 |
| 1736.0 | 15.5 |
| 1737.0 | 15.5 |
| 1738.0 | 15.5 |
| 1739.0 | 15.5 |
| 1740.0 | 15.5 |
| 1741.0 | 15.5 |
| 1742.0 | 15.5 |
| 1743.0 | 15.5 |
| 1744.0 | 15.5 |
| 1745.0 | 15.5 |
| 1746.0 | 15.5 |
| 1747.0 | 15.5 |
| 1748.0 | 15.5 |
| 1749.0 | 15.5 |
| 1750.0 | 15.5 |
| 1751.0 | 15.5 |
| 1752.0 | 15.5 |
| 1753.0 | 15.5 |
| 1754.0 | 15.5 |
| 1755.0 | 15.5 |
| 1756.0 | 15.5 |
| 1757.0 | 15.5 |
| 1758.0 | 15.5 |
| 1759.0 | 15.5 |
| 1760.0 | 15.5 |
| 1761.0 | 15.5 |
| 1762.0 | 15.5 |
| 1763.0 | 15.5 |
| 1764.0 | 15.5 |
| 1765.0 | 15.5 |
| 1766.0 | 15.5 |
| 1767.0 | 15.5 |
| 1768.0 | 15.5 |
| 1769.0 | 15.5 |
| 1770.0 | 15.5 |
| 1771.0 | 15.5 |
| 1772.0 | 15.5 |
| 1773.0 | 15.5 |
| 1774.0 | 15.5 |
| 1775.0 | 15.5 |
| 1776.0 | 15.5 |
| 1777.0 | 15.5 |
| 1778.0 | 15.5 |
| 1779.0 | 15.5 |
| 1780.0 | 15.5 |
| 1781.0 | 15.5 |
| 1782.0 | 15.5 |
| 1783.0 | 15.5 |
| 1784.0 | 15.5 |
| 1785.0 | 15.5 |
| 1786.0 | 15.5 |
| 1787.0 | 15.5 |
| 1788.0 | 15.5 |
| 1789.0 | 15.5 |
| 1790.0 | 15.5 |
| 1791.0 | 15.5 |
| 1792.0 | 15.5 |
| 1793.0 | 15.5 |
| 1794.0 | 15.5 |
| 1795.0 | 15.5 |
| 1796.0 | 15.5 |
| 1797.0 | 15.5 |
| 1798.0 | 15.5 |
| 1799.0 | 15.5 |
| 1800.0 | 15.5 |
| 1801.0 | 15.5 |
| 1802.0 | 15.5 |
| 1803.0 | 15.5 |
| 1804.0 | 15.5 |
| 1805.0 | 15.5 |
| 1806.0 | 15.5 |
| 1807.0 | 15.5 |
| 1808.0 | 15.5 |
| 1809.0 | 15.5 |
| 1810.0 | 15.5 |
| 1811.0 | 15.5 |
| 1812.0 | 15.5 |
| 1813.0 | 15.5 |
| 1814.0 | 15.5 |
| 1815.0 | 15.5 |
| 1816.0 | 15.5 |
| 1817.0 | 15.5 |
| 1818.0 | 15.5 |
| 1819.0 | 15.5 |
| 1820.0 | 15.5 |
| 1821.0 | 15.5 |
| 1822.0 | 15.5 |
| 1823.0 | 15.5 |
| 1824.0 | 15.5 |
| 1825.0 | 15.5 |
| 1826.0 | 15.5 |
| 1827.0 | 15.5 |
| 1828.0 | 15.5 |
| 1829.0 | 15.5 |
| 1830.0 | 15.5 |
| 1831.0 | 15.5 |
| 1832.0 | 15.5 |
| 1833.0 | 15.5 |
| 1834.0 | 15.5 |
| 1835.0 | 15.5 |
| 1836.0 | 15.5 |
| 1837.0 | 15.5 |
| 1838.0 | 15.5 |
| 1839.0 | 15.5 |
| 1840.0 | 15.5 |
| 1841.0 | 15.5 |
| 1842.0 | 15.5 |
| 1843.0 | 15.5 |
| 1844.0 | 15.5 |
| 1845.0 | 15.5 |
| 1846.0 | 15.5 |
| 1847.0 | 15.5 |
| 1848.0 | 15.5 |
| 1849.0 | 15.5 |
| 1850.0 | 15.5 |
| 1851.0 | 15.5 |
| 1852.0 | 15.5 |
| 1853.0 | 15.5 |
| 1854.0 | 15.5 |
| 1855.0 | 15.5 |
| 1856.0 | 15.5 |
| 1857.0 | 15.5 |
| 1858.0 | 15.5 |
| 1859.0 | 15.5 |
| 1860.0 | 15.5 |
| 1861.0 | 15.5 |
| 1862.0 | 15.5 |
| 1863.0 | 15.5 |
| 1864.0 | 15.5 |
| 1865.0 | 15.5 |
| 1866.0 | 15.5 |
| 1867.0 | 15.5 |
| 1868.0 | 15.5 |
| 1869.0 | 15.5 |
| 1870.0 | 15.5 |
| 1871.0 | 15.5 |
| 1872.0 | 15.5 |
| 1873.0 | 15.5 |
| 1874.0 | 15.5 |
| 1875.0 | 15.5 |
| 1876.0 | 15.5 |
| 1877.0 | 15.5 |
| 1878.0 | 15.5 |
| 1879.0 | 15.5 |
| 1880.0 | 15.5 |
| 1881.0 | 15.5 |
| 1882.0 | 15.5 |
| 1883.0 | 15.5 |
| 1884.0 | 15.5 |
| 1885.0 | 15.5 |
| 1886.0 | 15.5 |
| 1887.0 | 15.5 |
| 1888.0 | 15.5 |
| 1889.0 | 15.5 |
| 1890.0 | 15.5 |
| 1891.0 | 15.5 |
| 1892.0 | 15.5 |
| 1893.0 | 15.5 |
| 1894.0 | 15.5 |
| 1895.0 | 15.5 |
| 1896.0 | 15.5 |
| 1897.0 | 15.5 |
| 1898.0 | 15.5 |
| 1899.0 | 15.5 |
| 1900.0 | 15.5 |
| 1901.0 | 15.5 |
| 1902.0 | 15.5 |
| 1903.0 | 15.5 |
| 1904.0 | 15.5 |
| 1905.0 | 15.5 |
| 1906.0 | 15.5 |
| 1907.0 | 15.5 |
| 1908.0 | 15.5 |
| 1909.0 | 15.5 |
| 1910.0 | 15.5 |
| 1911.0 | 15.5 |
| 1912.0 | 15.5 |
| 1913.0 | 15.5 |
| 1914.0 | 15.5 |
| 1915.0 | 15.5 |
| 1916.0 | 15.5 |
| 1917.0 | 15.5 |
| 1918.0 | 15.5 |
| 1919.0 | 15.5 |
| 1920.0 | 15.5 |
| 1921.0 | 15.5 |
| 1922.0 | 15.5 |
| 1923.0 | 15.5 |
| 1924.0 | 15.5 |
| 1925.0 | 15.5 |
| 1926.0 | 15.5 |
| 1927.0 | 15.5 |
| 1928.0 | 15.5 |
| 1929.0 | 15.5 |
| 1930.0 | 15.5 |
| 1931.0 | 15.5 |
| 1932.0 | 15.5 |
| 1933.0 | 15.5 |
| 1934.0 | 15.5 |
| 1935.0 | 15.5 |
| 1936.0 | 15.5 |
| 1937.0 | 15.5 |
| 1938.0 | 15.5 |
| 1939.0 | 15.5 |
| 1940.0 | 15.5 |
| 1941.0 | 15.5 |
| 1942.0 | 15.5 |
| 1943.0 | 15.5 |
| 1944.0 | 15.5 |
| 1945.0 | 15.5 |
| 1946.0 | 15.5 |
| 1947.0 | 15.5 |
| 1948.0 | 15.5 |
| 1949.0 | 15.5 |
| 1950.0 | 15.5 |
| 1951.0 | 15.5 |
| 1952.0 | 15.5 |
| 1953.0 | 15.5 |
| 1954.0 | 15.5 |
| 1955.0 | 15.5 |
| 1956.0 | 15.5 |
| 1957.0 | 15.5 |
| 1958.0 | 15.5 |
| 1959.0 | 15.5 |
| 1960.0 | 15.5 |
| 1961.0 | 15.5 |
| 1962.0 | 15.5 |
| 1963.0 | 15.5 |
| 1964.0 | 15.5 |
| 1965.0 | 15.5 |
| 1966.0 | 15.5 |
| 1967.0 | 15.5 |
| 1968.0 | 15.5 |
| 1969.0 | 15.5 |
| 1970.0 | 15.5 |
| 1971.0 | 15.5 |
| 1972.0 | 15.5 |
| 1973.0 | 15.5 |
| 1974.0 | 15.5 |
| 1975.0 | 15.5 |
| 1976.0 | 15.5 |
| 1977.0 | 15.5 |
| 1978.0 | 15.5 |
| 1979.0 | 15.5 |
| 1980.0 | 15.5 |
| 1981.0 | 15.5 |
| 1982.0 | 15.5 |
| 1983.0 | 15.5 |
| 1984.0 | 15.5 |
| 1985.0 | 15.5 |
| 1986.0 | 15.5 |
| 1987.0 | 15.5 |
| 1988.0 | 15.5 |
| 1989.0 | 15.5 |
| 1990.0 | 15.5 |
| 1991.0 | 15.5 |
| 1992.0 | 15.5 |
| 1993.0 | 15.5 |
| 1994.0 | 15.5 |
| 1995.0 | 15.5 |
| 1996.0 | 15.5 |
| 1997.0 | 15.5 |
| 1998.0 | 15.5 |
| 1999.0 | 15.5 |
| 2000.0 | 15.5 |
| 2001.0 | 15 |
| 2002.0 | 15 |
| 2003.0 | 15 |
| 2004.0 | 15 |
| 2005.0 | 15 |
| 2006.0 | 15 |
| 2007.0 | 15 |
| 2008.0 | 15 |
| 2009.0 | 15 |
| 2010.0 | 15 |
| 2011.0 | 15 |
| 2012.0 | 15 |
| 2013.0 | 15 |
| 2014.0 | 15 |
| 2015.0 | 15 |
| 2016.0 | 15 |
| 2017.0 | 15 |
| 2018.0 | 15 |
| 2019.0 | 15 |
| 2020.0 | 15 |
| 2021.0 | 15 |
| 2022.0 | 15 |
| 2023.0 | 15 |
| 2024.0 | 15 |
| 2025.0 | 15 |
| 2026.0 | 15 |
| 2027.0 | 15 |
| 2028.0 | 15 |
| 2029.0 | 15 |
| 2030.0 | 15 |
| 2031.0 | 15 |
| 2032.0 | 15 |
| 2033.0 | 15 |
| 2034.0 | 15 |
| 2035.0 | 15 |
| 2036.0 | 15 |
| 2037.0 | 15 |
| 2038.0 | 15 |
| 2039.0 | 15 |
| 2040.0 | 15 |
| 2041.0 | 15 |
| 2042.0 | 15 |
| 2043.0 | 15 |
| 2044.0 | 15 |
| 2045.0 | 15 |
| 2046.0 | 15 |
| 2047.0 | 15 |
| 2048.0 | 15 |
| 2049.0 | 15 |
| 2050.0 | 15 |
| 2051.0 | 15 |
| 2052.0 | 15 |
| 2053.0 | 15 |
| 2054.0 | 15 |
| 2055.0 | 15 |
| 2056.0 | 15 |
| 2057.0 | 15 |
| 2058.0 | 15 |
| 2059.0 | 15 |
| 2060.0 | 15 |
| 2061.0 | 15 |
| 2062.0 | 15 |
| 2063.0 | 15 |
| 2064.0 | 15 |
| 2065.0 | 15 |
| 2066.0 | 15 |
| 2067.0 | 15 |
| 2068.0 | 15 |
| 2069.0 | 15 |
| 2070.0 | 15 |
| 2071.0 | 15 |
| 2072.0 | 15 |
| 2073.0 | 15 |
| 2074.0 | 15 |
| 2075.0 | 15 |
| 2076.0 | 15 |
| 2077.0 | 15 |
| 2078.0 | 15 |
| 2079.0 | 15 |
| 2080.0 | 15 |
| 2081.0 | 15 |
| 2082.0 | 15 |
| 2083.0 | 15 |
| 2084.0 | 15 |
| 2085.0 | 15 |
| 2086.0 | 15 |
| 2087.0 | 15 |
| 2088.0 | 15 |
| 2089.0 | 15 |
| 2090.0 | 15 |
| 2091.0 | 15 |
| 2092.0 | 15 |
| 2093.0 | 15 |
| 2094.0 | 15 |
| 2095.0 | 15 |
| 2096.0 | 15 |
| 2097.0 | 15 |
| 2098.0 | 15 |
| 2099.0 | 15 |
| 2100.0 | 15 |
| 2101.0 | 15 |
| 2102.0 | 15 |
| 2103.0 | 15 |
| 2104.0 | 15 |
| 2105.0 | 15 |
| 2106.0 | 15 |
| 2107.0 | 15 |
| 2108.0 | 15 |
| 2109.0 | 15 |
| 2110.0 | 15 |
| 2111.0 | 15 |
| 2112.0 | 15 |
| 2113.0 | 15 |
| 2114.0 | 15 |
| 2115.0 | 15 |
| 2116.0 | 15 |
| 2117.0 | 15 |
| 2118.0 | 15 |
| 2119.0 | 15 |
| 2120.0 | 15 |
| 2121.0 | 15 |
| 2122.0 | 15 |
| 2123.0 | 15 |
| 2124.0 | 15 |
| 2125.0 | 15 |
| 2126.0 | 15 |
| 2127.0 | 15 |
| 2128.0 | 15 |
| 2129.0 | 15 |
| 2130.0 | 15 |
| 2131.0 | 15 |
| 2132.0 | 15 |
| 2133.0 | 15 |
| 2134.0 | 15 |
| 2135.0 | 15 |
| 2136.0 | 15 |
| 2137.0 | 15 |
| 2138.0 | 15 |
| 2139.0 | 15 |
| 2140.0 | 15 |
| 2141.0 | 15 |
| 2142.0 | 15 |
| 2143.0 | 15 |
| 2144.0 | 15 |
| 2145.0 | 15 |
| 2146.0 | 15 |
| 2147.0 | 15 |
| 2148.0 | 15 |
| 2149.0 | 15 |
| 2150.0 | 15 |
| 2151.0 | 15 |
| 2152.0 | 15 |
| 2153.0 | 15 |
| 2154.0 | 15 |
| 2155.0 | 15 |
| 2156.0 | 15 |
| 2157.0 | 15 |
| 2158.0 | 15 |
| 2159.0 | 15 |
| 2160.0 | 15 |
| 2161.0 | 15 |
| 2162.0 | 15 |
| 2163.0 | 15 |
| 2164.0 | 15 |
| 2165.0 | 15 |
| 2166.0 | 15 |
| 2167.0 | 15 |
| 2168.0 | 15 |
| 2169.0 | 15 |
| 2170.0 | 15 |
| 2171.0 | 15 |
| 2172.0 | 15 |
| 2173.0 | 15 |
| 2174.0 | 15 |
| 2175.0 | 15 |
| 2176.0 | 15 |
| 2177.0 | 15 |
| 2178.0 | 15 |
| 2179.0 | 15 |
| 2180.0 | 15 |
| 2181.0 | 15 |
| 2182.0 | 15 |
| 2183.0 | 15 |
| 2184.0 | 15 |
| 2185.0 | 15 |
| 2186.0 | 15 |
| 2187.0 | 15 |
| 2188.0 | 15 |
| 2189.0 | 15 |
| 2190.0 | 15 |
| 2191.0 | 15 |
| 2192.0 | 15 |
| 2193.0 | 15 |
| 2194.0 | 15 |
| 2195.0 | 15 |
| 2196.0 | 15 |
| 2197.0 | 15 |
| 2198.0 | 15 |
| 2199.0 | 15 |
| 2200.0 | 15 |
| 2201.0 | 15 |
| 2202.0 | 15 |
| 2203.0 | 15 |
| 2204.0 | 15 |
| 2205.0 | 15 |
| 2206.0 | 15 |
| 2207.0 | 15 |
| 2208.0 | 15 |
| 2209.0 | 15 |
| 2210.0 | 15 |
| 2211.0 | 15 |
| 2212.0 | 15 |
| 2213.0 | 15 |
| 2214.0 | 15 |
| 2215.0 | 15 |
| 2216.0 | 15 |
| 2217.0 | 15 |
| 2218.0 | 15 |
| 2219.0 | 15 |
| 2220.0 | 15 |
| 2221.0 | 15 |
| 2222.0 | 15 |
| 2223.0 | 15 |
| 2224.0 | 15 |
| 2225.0 | 15 |
| 2226.0 | 15 |
| 2227.0 | 15 |
| 2228.0 | 15 |
| 2229.0 | 15 |
| 2230.0 | 15 |
| 2231.0 | 15 |
| 2232.0 | 15 |
| 2233.0 | 15 |
| 2234.0 | 15 |
| 2235.0 | 15 |
| 2236.0 | 15 |
| 2237.0 | 15 |
| 2238.0 | 15 |
| 2239.0 | 15 |
| 2240.0 | 15 |
| 2241.0 | 15 |
| 2242.0 | 15 |
| 2243.0 | 15 |
| 2244.0 | 15 |
| 2245.0 | 15 |
| 2246.0 | 15 |
| 2247.0 | 15 |
| 2248.0 | 15 |
| 2249.0 | 15 |
| 2250.0 | 15 |
| 2251.0 | 15 |
| 2252.0 | 15 |
| 2253.0 | 15 |
| 2254.0 | 15 |
| 2255.0 | 15 |
| 2256.0 | 15 |
| 2257.0 | 15 |
| 2258.0 | 15 |
| 2259.0 | 15 |
| 2260.0 | 15 |
| 2261.0 | 15 |
| 2262.0 | 15 |
| 2263.0 | 15 |
| 2264.0 | 15 |
| 2265.0 | 15 |
| 2266.0 | 15 |
| 2267.0 | 15 |
| 2268.0 | 15 |
| 2269.0 | 15 |
| 2270.0 | 15 |
| 2271.0 | 15 |
| 2272.0 | 15 |
| 2273.0 | 15 |
| 2274.0 | 15 |
| 2275.0 | 15 |
| 2276.0 | 15 |
| 2277.0 | 15 |
| 2278.0 | 15 |
| 2279.0 | 15 |
| 2280.0 | 15 |
| 2281.0 | 15 |
| 2282.0 | 15 |
| 2283.0 | 15 |
| 2284.0 | 15 |
| 2285.0 | 15 |
| 2286.0 | 15 |
| 2287.0 | 15 |
| 2288.0 | 15 |
| 2289.0 | 15 |
| 2290.0 | 15 |
| 2291.0 | 15 |
| 2292.0 | 15 |
| 2293.0 | 15 |
| 2294.0 | 15 |
| 2295.0 | 15 |
| 2296.0 | 15 |
| 2297.0 | 15 |
| 2298.0 | 15 |
| 2299.0 | 15 |
| 2300.0 | 15 |
| 2301.0 | 15 |
| 2302.0 | 15 |
| 2303.0 | 15 |
| 2304.0 | 15 |
| 2305.0 | 15 |
| 2306.0 | 15 |
| 2307.0 | 15 |
| 2308.0 | 15 |
| 2309.0 | 15 |
| 2310.0 | 15 |
| 2311.0 | 15 |
| 2312.0 | 15 |
| 2313.0 | 15 |
| 2314.0 | 15 |
| 2315.0 | 15 |
| 2316.0 | 15 |
| 2317.0 | 15 |
| 2318.0 | 15 |
| 2319.0 | 15 |
| 2320.0 | 15 |
| 2321.0 | 15 |
| 2322.0 | 15 |
| 2323.0 | 15 |
| 2324.0 | 15 |
| 2325.0 | 15 |
| 2326.0 | 15 |
| 2327.0 | 15 |
| 2328.0 | 15 |
| 2329.0 | 15 |
| 2330.0 | 15 |
| 2331.0 | 15 |
| 2332.0 | 15 |
| 2333.0 | 15 |
| 2334.0 | 15 |
| 2335.0 | 15 |
| 2336.0 | 15 |
| 2337.0 | 15 |
| 2338.0 | 15 |
| 2339.0 | 15 |
| 2340.0 | 15 |
| 2341.0 | 15 |
| 2342.0 | 15 |
| 2343.0 | 15 |
| 2344.0 | 15 |
| 2345.0 | 15 |
| 2346.0 | 15 |
| 2347.0 | 15 |
| 2348.0 | 15 |
| 2349.0 | 15 |
| 2350.0 | 15 |
| 2351.0 | 15 |
| 2352.0 | 15 |
| 2353.0 | 15 |
| 2354.0 | 15 |
| 2355.0 | 15 |
| 2356.0 | 15 |
| 2357.0 | 15 |
| 2358.0 | 15 |
| 2359.0 | 15 |
| 2360.0 | 15 |
| 2361.0 | 15 |
| 2362.0 | 15 |
| 2363.0 | 15 |
| 2364.0 | 15 |
| 2365.0 | 15 |
| 2366.0 | 15 |
| 2367.0 | 15 |
| 2368.0 | 15 |
| 2369.0 | 15 |
| 2370.0 | 15 |
| 2371.0 | 15 |
| 2372.0 | 15 |
| 2373.0 | 15 |
| 2374.0 | 15 |
| 2375.0 | 15 |
| 2376.0 | 15 |
| 2377.0 | 15 |
| 2378.0 | 15 |
| 2379.0 | 15 |
| 2380.0 | 15 |
| 2381.0 | 15 |
| 2382.0 | 15 |
| 2383.0 | 15 |
| 2384.0 | 15 |
| 2385.0 | 15 |
| 2386.0 | 15 |
| 2387.0 | 15 |
| 2388.0 | 15 |
| 2389.0 | 15 |
| 2390.0 | 15 |
| 2391.0 | 15 |
| 2392.0 | 15 |
| 2393.0 | 15 |
| 2394.0 | 15 |
| 2395.0 | 15 |
| 2396.0 | 15 |
| 2397.0 | 15 |
| 2398.0 | 15 |
| 2399.0 | 15 |
| 2400.0 | 15 |
| 2401.0 | 15 |
| 2402.0 | 15 |
| 2403.0 | 15 |
| 2404.0 | 15 |
| 2405.0 | 15 |
| 2406.0 | 15 |
| 2407.0 | 15 |
| 2408.0 | 15 |
| 2409.0 | 15 |
| 2410.0 | 15 |
| 2411.0 | 15 |
| 2412.0 | 15 |
| 2413.0 | 15 |
| 2414.0 | 15 |
| 2415.0 | 15 |
| 2416.0 | 15 |
| 2417.0 | 15 |
| 2418.0 | 15 |
| 2419.0 | 15 |
| 2420.0 | 15 |
| 2421.0 | 15 |
| 2422.0 | 15 |
| 2423.0 | 15 |
| 2424.0 | 15 |
| 2425.0 | 15 |
| 2426.0 | 15 |
| 2427.0 | 15 |
| 2428.0 | 15 |
| 2429.0 | 15 |
| 2430.0 | 15 |
| 2431.0 | 15 |
| 2432.0 | 15 |
| 2433.0 | 15 |
| 2434.0 | 15 |
| 2435.0 | 15 |
| 2436.0 | 15 |
| 2437.0 | 15 |
| 2438.0 | 15 |
| 2439.0 | 15 |
| 2440.0 | 15 |
| 2441.0 | 15 |
| 2442.0 | 15 |
| 2443.0 | 15 |
| 2444.0 | 15 |
| 2445.0 | 15 |
| 2446.0 | 15 |
| 2447.0 | 15 |
| 2448.0 | 15 |
| 2449.0 | 15 |
| 2450.0 | 15 |
| 2451.0 | 15 |
| 2452.0 | 15 |
| 2453.0 | 15 |
| 2454.0 | 15 |
| 2455.0 | 15 |
| 2456.0 | 15 |
| 2457.0 | 15 |
| 2458.0 | 15 |
| 2459.0 | 15 |
| 2460.0 | 15 |
| 2461.0 | 15 |
| 2462.0 | 15 |
| 2463.0 | 15 |
| 2464.0 | 15 |
| 2465.0 | 15 |
| 2466.0 | 15 |
| 2467.0 | 15 |
| 2468.0 | 15 |
| 2469.0 | 15 |
| 2470.0 | 15 |
| 2471.0 | 15 |
| 2472.0 | 15 |
| 2473.0 | 15 |
| 2474.0 | 15 |
| 2475.0 | 15 |
| 2476.0 | 15 |
| 2477.0 | 15 |
| 2478.0 | 15 |
| 2479.0 | 15 |
| 2480.0 | 15 |
| 2481.0 | 15 |
| 2482.0 | 15 |
| 2483.0 | 15 |
| 2484.0 | 15 |
| 2485.0 | 15 |
| 2486.0 | 15 |
| 2487.0 | 15 |
| 2488.0 | 15 |
| 2489.0 | 15 |
| 2490.0 | 15 |
| 2491.0 | 15 |
| 2492.0 | 15 |
| 2493.0 | 15 |
| 2494.0 | 15 |
| 2495.0 | 15 |
| 2496.0 | 15 |
| 2497.0 | 15 |
| 2498.0 | 15 |
| 2499.0 | 15 |
| 2500.0 | 15 |
| 2501.0 | 15 |
| 2502.0 | 15 |
| 2503.0 | 15 |
| 2504.0 | 15 |
| 2505.0 | 15 |
| 2506.0 | 15 |
| 2507.0 | 15 |
| 2508.0 | 15 |
| 2509.0 | 15 |
| 2510.0 | 15 |
| 2511.0 | 15 |
| 2512.0 | 15 |
| 2513.0 | 15 |
| 2514.0 | 15 |
| 2515.0 | 15 |
| 2516.0 | 15 |
| 2517.0 | 15 |
| 2518.0 | 15 |
| 2519.0 | 15 |
| 2520.0 | 15 |
| 2521.0 | 15 |
| 2522.0 | 15 |
| 2523.0 | 15 |
| 2524.0 | 15 |
| 2525.0 | 15 |
| 2526.0 | 15 |
| 2527.0 | 15 |
| 2528.0 | 15 |
| 2529.0 | 15 |
| 2530.0 | 15 |
| 2531.0 | 15 |
| 2532.0 | 15 |
| 2533.0 | 15 |
| 2534.0 | 15 |
| 2535.0 | 15 |
| 2536.0 | 15 |
| 2537.0 | 15 |
| 2538.0 | 15 |
| 2539.0 | 15 |
| 2540.0 | 15 |
| 2541.0 | 15 |
| 2542.0 | 15 |
| 2543.0 | 15 |
| 2544.0 | 15 |
| 2545.0 | 15 |
| 2546.0 | 15 |
| 2547.0 | 15 |
| 2548.0 | 15 |
| 2549.0 | 15 |
| 2550.0 | 15 |
| 2551.0 | 15 |
| 2552.0 | 15 |
| 2553.0 | 15 |
| 2554.0 | 15 |
| 2555.0 | 15 |
| 2556.0 | 15 |
| 2557.0 | 15 |
| 2558.0 | 15 |
| 2559.0 | 15 |
| 2560.0 | 15 |
| 2561.0 | 15 |
| 2562.0 | 15 |
| 2563.0 | 15 |
| 2564.0 | 15 |
| 2565.0 | 15 |
| 2566.0 | 15 |
| 2567.0 | 15 |
| 2568.0 | 15 |
| 2569.0 | 15 |
| 2570.0 | 15 |
| 2571.0 | 15 |
| 2572.0 | 15 |
| 2573.0 | 15 |
| 2574.0 | 15 |
| 2575.0 | 15 |
| 2576.0 | 15 |
| 2577.0 | 15 |
| 2578.0 | 15 |
| 2579.0 | 15 |
| 2580.0 | 15 |
| 2581.0 | 15 |
| 2582.0 | 15 |
| 2583.0 | 15 |
| 2584.0 | 15 |
| 2585.0 | 15 |
| 2586.0 | 15 |
| 2587.0 | 15 |
| 2588.0 | 15 |
| 2589.0 | 15 |
| 2590.0 | 15 |
| 2591.0 | 15 |
| 2592.0 | 15 |
| 2593.0 | 15 |
| 2594.0 | 15 |
| 2595.0 | 15 |
| 2596.0 | 15 |
| 2597.0 | 15 |
| 2598.0 | 15 |
| 2599.0 | 15 |
| 2600.0 | 15 |
| 2601.0 | 15 |
| 2602.0 | 15 |
| 2603.0 | 15 |
| 2604.0 | 15 |
| 2605.0 | 15 |
| 2606.0 | 15 |
| 2607.0 | 15 |
| 2608.0 | 15 |
| 2609.0 | 15 |
| 2610.0 | 15 |
| 2611.0 | 15 |
| 2612.0 | 15 |
| 2613.0 | 15 |
| 2614.0 | 15 |
| 2615.0 | 15 |
| 2616.0 | 15 |
| 2617.0 | 15 |
| 2618.0 | 15 |
| 2619.0 | 15 |
| 2620.0 | 15 |
| 2621.0 | 15 |
| 2622.0 | 15 |
| 2623.0 | 15 |
| 2624.0 | 15 |
| 2625.0 | 15 |
| 2626.0 | 15 |
| 2627.0 | 15 |
| 2628.0 | 15 |
| 2629.0 | 15 |
| 2630.0 | 15 |
| 2631.0 | 15 |
| 2632.0 | 15 |
| 2633.0 | 15 |
| 2634.0 | 15 |
| 2635.0 | 15 |
| 2636.0 | 15 |
| 2637.0 | 15 |
| 2638.0 | 15 |
| 2639.0 | 15 |
| 2640.0 | 15 |
| 2641.0 | 15 |
| 2642.0 | 15 |
| 2643.0 | 15 |
| 2644.0 | 15 |
| 2645.0 | 15 |
| 2646.0 | 15 |
| 2647.0 | 15 |
| 2648.0 | 15 |
| 2649.0 | 15 |
| 2650.0 | 15 |
| 2651.0 | 15 |
| 2652.0 | 15 |
| 2653.0 | 15 |
| 2654.0 | 15 |
| 2655.0 | 15 |
| 2656.0 | 15 |
| 2657.0 | 15 |
| 2658.0 | 15 |
| 2659.0 | 15 |
| 2660.0 | 15 |
| 2661.0 | 15 |
| 2662.0 | 15 |
| 2663.0 | 15 |
| 2664.0 | 15 |
| 2665.0 | 15 |
| 2666.0 | 15 |
| 2667.0 | 15 |
| 2668.0 | 15 |
| 2669.0 | 15 |
| 2670.0 | 15 |
| 2671.0 | 15 |
| 2672.0 | 15 |
| 2673.0 | 15 |
| 2674.0 | 15 |
| 2675.0 | 15 |
| 2676.0 | 15 |
| 2677.0 | 15 |
| 2678.0 | 15 |
| 2679.0 | 15 |
| 2680.0 | 15 |
| 2681.0 | 15 |
| 2682.0 | 15 |
| 2683.0 | 15 |
| 2684.0 | 15 |
| 2685.0 | 15 |
| 2686.0 | 15 |
| 2687.0 | 15 |
| 2688.0 | 15 |
| 2689.0 | 15 |
| 2690.0 | 15 |
| 2691.0 | 15 |
| 2692.0 | 15 |
| 2693.0 | 15 |
| 2694.0 | 15 |
| 2695.0 | 15 |
| 2696.0 | 15 |
| 2697.0 | 15 |
| 2698.0 | 15 |
| 2699.0 | 15 |
| 2700.0 | 15 |
| 2701.0 | 15 |
| 2702.0 | 15 |
| 2703.0 | 15 |
| 2704.0 | 15 |
| 2705.0 | 15 |
| 2706.0 | 15 |
| 2707.0 | 15 |
| 2708.0 | 15 |
| 2709.0 | 15 |
| 2710.0 | 15 |
| 2711.0 | 15 |
| 2712.0 | 15 |
| 2713.0 | 15 |
| 2714.0 | 15 |
| 2715.0 | 15 |
| 2716.0 | 15 |
| 2717.0 | 15 |
| 2718.0 | 15 |
| 2719.0 | 15 |
| 2720.0 | 15 |
| 2721.0 | 15 |
| 2722.0 | 15 |
| 2723.0 | 15 |
| 2724.0 | 15 |
| 2725.0 | 15 |
| 2726.0 | 15 |
| 2727.0 | 15 |
| 2728.0 | 15 |
| 2729.0 | 15 |
| 2730.0 | 15 |
| 2731.0 | 15 |
| 2732.0 | 15 |
| 2733.0 | 15 |
| 2734.0 | 15 |
| 2735.0 | 15 |
| 2736.0 | 15 |
| 2737.0 | 15 |
| 2738.0 | 15 |
| 2739.0 | 15 |
| 2740.0 | 15 |
| 2741.0 | 15 |
| 2742.0 | 15 |
| 2743.0 | 15 |
| 2744.0 | 15 |
| 2745.0 | 15 |
| 2746.0 | 15 |
| 2747.0 | 15 |
| 2748.0 | 15 |
| 2749.0 | 15 |
| 2750.0 | 15 |
| 2751.0 | 15 |
| 2752.0 | 15 |
| 2753.0 | 15 |
| 2754.0 | 15 |
| 2755.0 | 15 |
| 2756.0 | 15 |
| 2757.0 | 15 |
| 2758.0 | 15 |
| 2759.0 | 15 |
| 2760.0 | 15 |
| 2761.0 | 15 |
| 2762.0 | 15 |
| 2763.0 | 15 |
| 2764.0 | 15 |
| 2765.0 | 15 |
| 2766.0 | 15 |
| 2767.0 | 15 |
| 2768.0 | 15 |
| 2769.0 | 15 |
| 2770.0 | 15 |
| 2771.0 | 15 |
| 2772.0 | 15 |
| 2773.0 | 15 |
| 2774.0 | 15 |
| 2775.0 | 15 |
| 2776.0 | 15 |
| 2777.0 | 15 |
| 2778.0 | 15 |
| 2779.0 | 15 |
| 2780.0 | 15 |
| 2781.0 | 15 |
| 2782.0 | 15 |
| 2783.0 | 15 |
| 2784.0 | 15 |
| 2785.0 | 15 |
| 2786.0 | 15 |
| 2787.0 | 15 |
| 2788.0 | 15 |
| 2789.0 | 15 |
| 2790.0 | 15 |
| 2791.0 | 15 |
| 2792.0 | 15 |
| 2793.0 | 15 |
| 2794.0 | 15 |
| 2795.0 | 15 |
| 2796.0 | 15 |
| 2797.0 | 15 |
| 2798.0 | 15 |
| 2799.0 | 15 |
| 2800.0 | 15 |
| 2801.0 | 15 |
| 2802.0 | 15 |
| 2803.0 | 15 |
| 2804.0 | 15 |
| 2805.0 | 15 |
| 2806.0 | 15 |
| 2807.0 | 15 |
| 2808.0 | 15 |
| 2809.0 | 15 |
| 2810.0 | 15 |
| 2811.0 | 15 |
| 2812.0 | 15 |
| 2813.0 | 15 |
| 2814.0 | 15 |
| 2815.0 | 15 |
| 2816.0 | 15 |
| 2817.0 | 15 |
| 2818.0 | 15 |
| 2819.0 | 15 |
| 2820.0 | 15 |
| 2821.0 | 15 |
| 2822.0 | 15 |
| 2823.0 | 15 |
| 2824.0 | 15 |
| 2825.0 | 15 |
| 2826.0 | 15 |
| 2827.0 | 15 |
| 2828.0 | 15 |
| 2829.0 | 15 |
| 2830.0 | 15 |
| 2831.0 | 15 |
| 2832.0 | 15 |
| 2833.0 | 15 |
| 2834.0 | 15 |
| 2835.0 | 15 |
| 2836.0 | 15 |
| 2837.0 | 15 |
| 2838.0 | 15 |
| 2839.0 | 15 |
| 2840.0 | 15 |
| 2841.0 | 15 |
| 2842.0 | 15 |
| 2843.0 | 15 |
| 2844.0 | 15 |
| 2845.0 | 15 |
| 2846.0 | 15 |
| 2847.0 | 15 |
| 2848.0 | 15 |
| 2849.0 | 15 |
| 2850.0 | 15 |
| 2851.0 | 15 |
| 2852.0 | 15 |
| 2853.0 | 15 |
| 2854.0 | 15 |
| 2855.0 | 15 |
| 2856.0 | 15 |
| 2857.0 | 15 |
| 2858.0 | 15 |
| 2859.0 | 15 |
| 2860.0 | 15 |
| 2861.0 | 15 |
| 2862.0 | 15 |
| 2863.0 | 15 |
| 2864.0 | 15 |
| 2865.0 | 15 |
| 2866.0 | 15 |
| 2867.0 | 15 |
| 2868.0 | 15 |
| 2869.0 | 15 |
| 2870.0 | 15 |
| 2871.0 | 15 |
| 2872.0 | 15 |
| 2873.0 | 15 |
| 2874.0 | 15 |
| 2875.0 | 15 |
| 2876.0 | 15 |
| 2877.0 | 15 |
| 2878.0 | 15 |
| 2879.0 | 15 |
| 2880.0 | 15 |
| 2881.0 | 15 |
| 2882.0 | 15 |
| 2883.0 | 15 |
| 2884.0 | 15 |
| 2885.0 | 15 |
| 2886.0 | 15 |
| 2887.0 | 15 |
| 2888.0 | 15 |
| 2889.0 | 15 |
| 2890.0 | 15 |
| 2891.0 | 15 |
| 2892.0 | 15 |
| 2893.0 | 15 |
| 2894.0 | 15 |
| 2895.0 | 15 |
| 2896.0 | 15 |
| 2897.0 | 15 |
| 2898.0 | 15 |
| 2899.0 | 15 |
| 2900.0 | 15 |
| 2901.0 | 15 |
| 2902.0 | 15 |
| 2903.0 | 15 |
| 2904.0 | 15 |
| 2905.0 | 15 |
| 2906.0 | 15 |
| 2907.0 | 15 |
| 2908.0 | 15 |
| 2909.0 | 15 |
| 2910.0 | 15 |
| 2911.0 | 15 |
| 2912.0 | 15 |
| 2913.0 | 15 |
| 2914.0 | 15 |
| 2915.0 | 15 |
| 2916.0 | 15 |
| 2917.0 | 15 |
| 2918.0 | 15 |
| 2919.0 | 15 |
| 2920.0 | 15 |
| 2921.0 | 15 |
| 2922.0 | 15 |
| 2923.0 | 15 |
| 2924.0 | 15 |
| 2925.0 | 15 |
| 2926.0 | 15 |
| 2927.0 | 15 |
| 2928.0 | 15 |
| 2929.0 | 15 |
| 2930.0 | 15 |
| 2931.0 | 15 |
| 2932.0 | 15 |
| 2933.0 | 15 |
| 2934.0 | 15 |
| 2935.0 | 15 |
| 2936.0 | 15 |
| 2937.0 | 15 |
| 2938.0 | 15 |
| 2939.0 | 15 |
| 2940.0 | 15 |
| 2941.0 | 15 |
| 2942.0 | 15 |
| 2943.0 | 15 |
| 2944.0 | 15 |
| 2945.0 | 15 |
| 2946.0 | 15 |
| 2947.0 | 15 |
| 2948.0 | 15 |
| 2949.0 | 15 |
| 2950.0 | 15 |
| 2951.0 | 15 |
| 2952.0 | 15 |
| 2953.0 | 15 |
| 2954.0 | 15 |
| 2955.0 | 15 |
| 2956.0 | 15 |
| 2957.0 | 15 |
| 2958.0 | 15 |
| 2959.0 | 15 |
| 2960.0 | 15 |
| 2961.0 | 15 |
| 2962.0 | 15 |
| 2963.0 | 15 |
| 2964.0 | 15 |
| 2965.0 | 15 |
| 2966.0 | 15 |
| 2967.0 | 15 |
| 2968.0 | 15 |
| 2969.0 | 15 |
| 2970.0 | 15 |
| 2971.0 | 15 |
| 2972.0 | 15 |
| 2973.0 | 15 |
| 2974.0 | 15 |
| 2975.0 | 15 |
| 2976.0 | 15 |
| 2977.0 | 15 |
| 2978.0 | 15 |
| 2979.0 | 15 |
| 2980.0 | 15 |
| 2981.0 | 15 |
| 2982.0 | 15 |
| 2983.0 | 15 |
| 2984.0 | 15 |
| 2985.0 | 15 |
| 2986.0 | 15 |
| 2987.0 | 15 |
| 2988.0 | 15 |
| 2989.0 | 15 |
| 2990.0 | 15 |
| 2991.0 | 15 |
| 2992.0 | 15 |
| 2993.0 | 15 |
| 2994.0 | 15 |
| 2995.0 | 15 |
| 2996.0 | 15 |
| 2997.0 | 15 |
| 2998.0 | 15 |
| 2999.0 | 15 |
| 3000.0 | 15 |
| 3001.0 | 14.5 |
| 3002.0 | 14.5 |
| 3003.0 | 14.5 |
| 3004.0 | 14.5 |
| 3005.0 | 14.5 |
| 3006.0 | 14.5 |
| 3007.0 | 14.5 |
| 3008.0 | 14.5 |
| 3009.0 | 14.5 |
| 3010.0 | 14.5 |
| 3011.0 | 14.5 |
| 3012.0 | 14.5 |
| 3013.0 | 14.5 |
| 3014.0 | 14.5 |
| 3015.0 | 14.5 |
| 3016.0 | 14.5 |
| 3017.0 | 14.5 |
| 3018.0 | 14.5 |
| 3019.0 | 14.5 |
| 3020.0 | 14.5 |
| 3021.0 | 14.5 |
| 3022.0 | 14.5 |
| 3023.0 | 14.5 |
| 3024.0 | 14.5 |
| 3025.0 | 14.5 |
| 3026.0 | 14.5 |
| 3027.0 | 14.5 |
| 3028.0 | 14.5 |
| 3029.0 | 14.5 |
| 3030.0 | 14.5 |
| 3031.0 | 14.5 |
| 3032.0 | 14.5 |
| 3033.0 | 14.5 |
| 3034.0 | 14.5 |
| 3035.0 | 14.5 |
| 3036.0 | 14.5 |
| 3037.0 | 14.5 |
| 3038.0 | 14.5 |
| 3039.0 | 14.5 |
| 3040.0 | 14.5 |
| 3041.0 | 14.5 |
| 3042.0 | 14.5 |
| 3043.0 | 14.5 |
| 3044.0 | 14.5 |
| 3045.0 | 14.5 |
| 3046.0 | 14.5 |
| 3047.0 | 14.5 |
| 3048.0 | 14.5 |
| 3049.0 | 14.5 |
| 3050.0 | 14.5 |
| 3051.0 | 14.5 |
| 3052.0 | 14.5 |
| 3053.0 | 14.5 |
| 3054.0 | 14.5 |
| 3055.0 | 14.5 |
| 3056.0 | 14.5 |
| 3057.0 | 14.5 |
| 3058.0 | 14.5 |
| 3059.0 | 14.5 |
| 3060.0 | 14.5 |
| 3061.0 | 14.5 |
| 3062.0 | 14.5 |
| 3063.0 | 14.5 |
| 3064.0 | 14.5 |
| 3065.0 | 14.5 |
| 3066.0 | 14.5 |
| 3067.0 | 14.5 |
| 3068.0 | 14.5 |
| 3069.0 | 14.5 |
| 3070.0 | 14.5 |
| 3071.0 | 14.5 |
| 3072.0 | 14.5 |
| 3073.0 | 14.5 |
| 3074.0 | 14.5 |
| 3075.0 | 14.5 |
| 3076.0 | 14.5 |
| 3077.0 | 14.5 |
| 3078.0 | 14.5 |
| 3079.0 | 14.5 |
| 3080.0 | 14.5 |
| 3081.0 | 14.5 |
| 3082.0 | 14.5 |
| 3083.0 | 14.5 |
| 3084.0 | 14.5 |
| 3085.0 | 14.5 |
| 3086.0 | 14.5 |
| 3087.0 | 14.5 |
| 3088.0 | 14.5 |
| 3089.0 | 14.5 |
| 3090.0 | 14.5 |
| 3091.0 | 14.5 |
| 3092.0 | 14.5 |
| 3093.0 | 14.5 |
| 3094.0 | 14.5 |
| 3095.0 | 14.5 |
| 3096.0 | 14.5 |
| 3097.0 | 14.5 |
| 3098.0 | 14.5 |
| 3099.0 | 14.5 |
| 3100.0 | 14.5 |
| 3101.0 | 14.5 |
| 3102.0 | 14.5 |
| 3103.0 | 14.5 |
| 3104.0 | 14.5 |
| 3105.0 | 14.5 |
| 3106.0 | 14.5 |
| 3107.0 | 14.5 |
| 3108.0 | 14.5 |
| 3109.0 | 14.5 |
| 3110.0 | 14.5 |
| 3111.0 | 14.5 |
| 3112.0 | 14.5 |
| 3113.0 | 14.5 |
| 3114.0 | 14.5 |
| 3115.0 | 14.5 |
| 3116.0 | 14.5 |
| 3117.0 | 14.5 |
| 3118.0 | 14.5 |
| 3119.0 | 14.5 |
| 3120.0 | 14.5 |
| 3121.0 | 14.5 |
| 3122.0 | 14.5 |
| 3123.0 | 14.5 |
| 3124.0 | 14.5 |
| 3125.0 | 14.5 |
| 3126.0 | 14.5 |
| 3127.0 | 14.5 |
| 3128.0 | 14.5 |
| 3129.0 | 14.5 |
| 3130.0 | 14.5 |
| 3131.0 | 14.5 |
| 3132.0 | 14.5 |
| 3133.0 | 14.5 |
| 3134.0 | 14.5 |
| 3135.0 | 14.5 |
| 3136.0 | 14.5 |
| 3137.0 | 14.5 |
| 3138.0 | 14.5 |
| 3139.0 | 14.5 |
| 3140.0 | 14.5 |
| 3141.0 | 14.5 |
| 3142.0 | 14.5 |
| 3143.0 | 14.5 |
| 3144.0 | 14.5 |
| 3145.0 | 14.5 |
| 3146.0 | 14.5 |
| 3147.0 | 14.5 |
| 3148.0 | 14.5 |
| 3149.0 | 14.5 |
| 3150.0 | 14.5 |
| 3151.0 | 14.5 |
| 3152.0 | 14.5 |
| 3153.0 | 14.5 |
| 3154.0 | 14.5 |
| 3155.0 | 14.5 |
| 3156.0 | 14.5 |
| 3157.0 | 14.5 |
| 3158.0 | 14.5 |
| 3159.0 | 14.5 |
| 3160.0 | 14.5 |
| 3161.0 | 14.5 |
| 3162.0 | 14.5 |
| 3163.0 | 14.5 |
| 3164.0 | 14.5 |
| 3165.0 | 14.5 |
| 3166.0 | 14.5 |
| 3167.0 | 14.5 |
| 3168.0 | 14.5 |
| 3169.0 | 14.5 |
| 3170.0 | 14.5 |
| 3171.0 | 14.5 |
| 3172.0 | 14.5 |
| 3173.0 | 14.5 |
| 3174.0 | 14.5 |
| 3175.0 | 14.5 |
| 3176.0 | 14.5 |
| 3177.0 | 14.5 |
| 3178.0 | 14.5 |
| 3179.0 | 14.5 |
| 3180.0 | 14.5 |
| 3181.0 | 14.5 |
| 3182.0 | 14.5 |
| 3183.0 | 14.5 |
| 3184.0 | 14.5 |
| 3185.0 | 14.5 |
| 3186.0 | 14.5 |
| 3187.0 | 14.5 |
| 3188.0 | 14.5 |
| 3189.0 | 14.5 |
| 3190.0 | 14.5 |
| 3191.0 | 14.5 |
| 3192.0 | 14.5 |
| 3193.0 | 14.5 |
| 3194.0 | 14.5 |
| 3195.0 | 14.5 |
| 3196.0 | 14.5 |
| 3197.0 | 14.5 |
| 3198.0 | 14.5 |
| 3199.0 | 14.5 |
| 3200.0 | 14.5 |
| 3201.0 | 14.5 |
| 3202.0 | 14.5 |
| 3203.0 | 14.5 |
| 3204.0 | 14.5 |
| 3205.0 | 14.5 |
| 3206.0 | 14.5 |
| 3207.0 | 14.5 |
| 3208.0 | 14.5 |
| 3209.0 | 14.5 |
| 3210.0 | 14.5 |
| 3211.0 | 14.5 |
| 3212.0 | 14.5 |
| 3213.0 | 14.5 |
| 3214.0 | 14.5 |
| 3215.0 | 14.5 |
| 3216.0 | 14.5 |
| 3217.0 | 14.5 |
| 3218.0 | 14.5 |
| 3219.0 | 14.5 |
| 3220.0 | 14.5 |
| 3221.0 | 14.5 |
| 3222.0 | 14.5 |
| 3223.0 | 14.5 |
| 3224.0 | 14.5 |
| 3225.0 | 14.5 |
| 3226.0 | 14.5 |
| 3227.0 | 14.5 |
| 3228.0 | 14.5 |
| 3229.0 | 14.5 |
| 3230.0 | 14.5 |
| 3231.0 | 14.5 |
| 3232.0 | 14.5 |
| 3233.0 | 14.5 |
| 3234.0 | 14.5 |
| 3235.0 | 14.5 |
| 3236.0 | 14.5 |
| 3237.0 | 14.5 |
| 3238.0 | 14.5 |
| 3239.0 | 14.5 |
| 3240.0 | 14.5 |
| 3241.0 | 14.5 |
| 3242.0 | 14.5 |
| 3243.0 | 14.5 |
| 3244.0 | 14.5 |
| 3245.0 | 14.5 |
| 3246.0 | 14.5 |
| 3247.0 | 14.5 |
| 3248.0 | 14.5 |
| 3249.0 | 14.5 |
| 3250.0 | 14.5 |
| 3251.0 | 14.5 |
| 3252.0 | 14.5 |
| 3253.0 | 14.5 |
| 3254.0 | 14.5 |
| 3255.0 | 14.5 |
| 3256.0 | 14.5 |
| 3257.0 | 14.5 |
| 3258.0 | 14.5 |
| 3259.0 | 14.5 |
| 3260.0 | 14.5 |
| 3261.0 | 14.5 |
| 3262.0 | 14.5 |
| 3263.0 | 14.5 |
| 3264.0 | 14.5 |
| 3265.0 | 14.5 |
| 3266.0 | 14.5 |
| 3267.0 | 14.5 |
| 3268.0 | 14.5 |
| 3269.0 | 14.5 |
| 3270.0 | 14.5 |
| 3271.0 | 14.5 |
| 3272.0 | 14.5 |
| 3273.0 | 14.5 |
| 3274.0 | 14.5 |
| 3275.0 | 14.5 |
| 3276.0 | 14.5 |
| 3277.0 | 14.5 |
| 3278.0 | 14.5 |
| 3279.0 | 14.5 |
| 3280.0 | 14.5 |
| 3281.0 | 14.5 |
| 3282.0 | 14.5 |
| 3283.0 | 14.5 |
| 3284.0 | 14.5 |
| 3285.0 | 14.5 |
| 3286.0 | 14.5 |
| 3287.0 | 14.5 |
| 3288.0 | 14.5 |
| 3289.0 | 14.5 |
| 3290.0 | 14.5 |
| 3291.0 | 14.5 |
| 3292.0 | 14.5 |
| 3293.0 | 14.5 |
| 3294.0 | 14.5 |
| 3295.0 | 14.5 |
| 3296.0 | 14.5 |
| 3297.0 | 14.5 |
| 3298.0 | 14.5 |
| 3299.0 | 14.5 |
| 3300.0 | 14.5 |
| 3301.0 | 14.5 |
| 3302.0 | 14.5 |
| 3303.0 | 14.5 |
| 3304.0 | 14.5 |
| 3305.0 | 14.5 |
| 3306.0 | 14.5 |
| 3307.0 | 14.5 |
| 3308.0 | 14.5 |
| 3309.0 | 14.5 |
| 3310.0 | 14.5 |
| 3311.0 | 14.5 |
| 3312.0 | 14.5 |
| 3313.0 | 14.5 |
| 3314.0 | 14.5 |
| 3315.0 | 14.5 |
| 3316.0 | 14.5 |
| 3317.0 | 14.5 |
| 3318.0 | 14.5 |
| 3319.0 | 14.5 |
| 3320.0 | 14.5 |
| 3321.0 | 14.5 |
| 3322.0 | 14.5 |
| 3323.0 | 14.5 |
| 3324.0 | 14.5 |
| 3325.0 | 14.5 |
| 3326.0 | 14.5 |
| 3327.0 | 14.5 |
| 3328.0 | 14.5 |
| 3329.0 | 14.5 |
| 3330.0 | 14.5 |
| 3331.0 | 14.5 |
| 3332.0 | 14.5 |
| 3333.0 | 14.5 |
| 3334.0 | 14.5 |
| 3335.0 | 14.5 |
| 3336.0 | 14.5 |
| 3337.0 | 14.5 |
| 3338.0 | 14.5 |
| 3339.0 | 14.5 |
| 3340.0 | 14.5 |
| 3341.0 | 14.5 |
| 3342.0 | 14.5 |
| 3343.0 | 14.5 |
| 3344.0 | 14.5 |
| 3345.0 | 14.5 |
| 3346.0 | 14.5 |
| 3347.0 | 14.5 |
| 3348.0 | 14.5 |
| 3349.0 | 14.5 |
| 3350.0 | 14.5 |
| 3351.0 | 14.5 |
| 3352.0 | 14.5 |
| 3353.0 | 14.5 |
| 3354.0 | 14.5 |
| 3355.0 | 14.5 |
| 3356.0 | 14.5 |
| 3357.0 | 14.5 |
| 3358.0 | 14.5 |
| 3359.0 | 14.5 |
| 3360.0 | 14.5 |
| 3361.0 | 14.5 |
| 3362.0 | 14.5 |
| 3363.0 | 14.5 |
| 3364.0 | 14.5 |
| 3365.0 | 14.5 |
| 3366.0 | 14.5 |
| 3367.0 | 14.5 |
| 3368.0 | 14.5 |
| 3369.0 | 14.5 |
| 3370.0 | 14.5 |
| 3371.0 | 14.5 |
| 3372.0 | 14.5 |
| 3373.0 | 14.5 |
| 3374.0 | 14.5 |
| 3375.0 | 14.5 |
| 3376.0 | 14.5 |
| 3377.0 | 14.5 |
| 3378.0 | 14.5 |
| 3379.0 | 14.5 |
| 3380.0 | 14.5 |
| 3381.0 | 14.5 |
| 3382.0 | 14.5 |
| 3383.0 | 14.5 |
| 3384.0 | 14.5 |
| 3385.0 | 14.5 |
| 3386.0 | 14.5 |
| 3387.0 | 14.5 |
| 3388.0 | 14.5 |
| 3389.0 | 14.5 |
| 3390.0 | 14.5 |
| 3391.0 | 14.5 |
| 3392.0 | 14.5 |
| 3393.0 | 14.5 |
| 3394.0 | 14.5 |
| 3395.0 | 14.5 |
| 3396.0 | 14.5 |
| 3397.0 | 14.5 |
| 3398.0 | 14.5 |
| 3399.0 | 14.5 |
| 3400.0 | 14.5 |
| 3401.0 | 14.5 |
| 3402.0 | 14.5 |
| 3403.0 | 14.5 |
| 3404.0 | 14.5 |
| 3405.0 | 14.5 |
| 3406.0 | 14.5 |
| 3407.0 | 14.5 |
| 3408.0 | 14.5 |
| 3409.0 | 14.5 |
| 3410.0 | 14.5 |
| 3411.0 | 14.5 |
| 3412.0 | 14.5 |
| 3413.0 | 14.5 |
| 3414.0 | 14.5 |
| 3415.0 | 14.5 |
| 3416.0 | 14.5 |
| 3417.0 | 14.5 |
| 3418.0 | 14.5 |
| 3419.0 | 14.5 |
| 3420.0 | 14.5 |
| 3421.0 | 14.5 |
| 3422.0 | 14.5 |
| 3423.0 | 14.5 |
| 3424.0 | 14.5 |
| 3425.0 | 14.5 |
| 3426.0 | 14.5 |
| 3427.0 | 14.5 |
| 3428.0 | 14.5 |
| 3429.0 | 14.5 |
| 3430.0 | 14.5 |
| 3431.0 | 14.5 |
| 3432.0 | 14.5 |
| 3433.0 | 14.5 |
| 3434.0 | 14.5 |
| 3435.0 | 14.5 |
| 3436.0 | 14.5 |
| 3437.0 | 14.5 |
| 3438.0 | 14.5 |
| 3439.0 | 14.5 |
| 3440.0 | 14.5 |
| 3441.0 | 14.5 |
| 3442.0 | 14.5 |
| 3443.0 | 14.5 |
| 3444.0 | 14.5 |
| 3445.0 | 14.5 |
| 3446.0 | 14.5 |
| 3447.0 | 14.5 |
| 3448.0 | 14.5 |
| 3449.0 | 14.5 |
| 3450.0 | 14.5 |
| 3451.0 | 14.5 |
| 3452.0 | 14.5 |
| 3453.0 | 14.5 |
| 3454.0 | 14.5 |
| 3455.0 | 14.5 |
| 3456.0 | 14.5 |
| 3457.0 | 14.5 |
| 3458.0 | 14.5 |
| 3459.0 | 14.5 |
| 3460.0 | 14.5 |
| 3461.0 | 14.5 |
| 3462.0 | 14.5 |
| 3463.0 | 14.5 |
| 3464.0 | 14.5 |
| 3465.0 | 14.5 |
| 3466.0 | 14.5 |
| 3467.0 | 14.5 |
| 3468.0 | 14.5 |
| 3469.0 | 14.5 |
| 3470.0 | 14.5 |
| 3471.0 | 14.5 |
| 3472.0 | 14.5 |
| 3473.0 | 14.5 |
| 3474.0 | 14.5 |
| 3475.0 | 14.5 |
| 3476.0 | 14.5 |
| 3477.0 | 14.5 |
| 3478.0 | 14.5 |
| 3479.0 | 14.5 |
| 3480.0 | 14.5 |
| 3481.0 | 14.5 |
| 3482.0 | 14.5 |
| 3483.0 | 14.5 |
| 3484.0 | 14.5 |
| 3485.0 | 14.5 |
| 3486.0 | 14.5 |
| 3487.0 | 14.5 |
| 3488.0 | 14.5 |
| 3489.0 | 14.5 |
| 3490.0 | 14.5 |
| 3491.0 | 14.5 |
| 3492.0 | 14.5 |
| 3493.0 | 14.5 |
| 3494.0 | 14.5 |
| 3495.0 | 14.5 |
| 3496.0 | 14.5 |
| 3497.0 | 14.5 |
| 3498.0 | 14.5 |
| 3499.0 | 14.5 |
| 3500.0 | 14.5 |
| 3501.0 | 14.5 |
| 3502.0 | 14.5 |
| 3503.0 | 14.5 |
| 3504.0 | 14.5 |
| 3505.0 | 14.5 |
| 3506.0 | 14.5 |
| 3507.0 | 14.5 |
| 3508.0 | 14.5 |
| 3509.0 | 14.5 |
| 3510.0 | 14.5 |
| 3511.0 | 14.5 |
| 3512.0 | 14.5 |
| 3513.0 | 14.5 |
| 3514.0 | 14.5 |
| 3515.0 | 14.5 |
| 3516.0 | 14.5 |
| 3517.0 | 14.5 |
| 3518.0 | 14.5 |
| 3519.0 | 14.5 |
| 3520.0 | 14.5 |
| 3521.0 | 14.5 |
| 3522.0 | 14.5 |
| 3523.0 | 14.5 |
| 3524.0 | 14.5 |
| 3525.0 | 14.5 |
| 3526.0 | 14.5 |
| 3527.0 | 14.5 |
| 3528.0 | 14.5 |
| 3529.0 | 14.5 |
| 3530.0 | 14.5 |
| 3531.0 | 14.5 |
| 3532.0 | 14.5 |
| 3533.0 | 14.5 |
| 3534.0 | 14.5 |
| 3535.0 | 14.5 |
| 3536.0 | 14.5 |
| 3537.0 | 14.5 |
| 3538.0 | 14.5 |
| 3539.0 | 14.5 |
| 3540.0 | 14.5 |
| 3541.0 | 14.5 |
| 3542.0 | 14.5 |
| 3543.0 | 14.5 |
| 3544.0 | 14.5 |
| 3545.0 | 14.5 |
| 3546.0 | 14.5 |
| 3547.0 | 14.5 |
| 3548.0 | 14.5 |
| 3549.0 | 14.5 |
| 3550.0 | 14.5 |
| 3551.0 | 14.5 |
| 3552.0 | 14.5 |
| 3553.0 | 14.5 |
| 3554.0 | 14.5 |
| 3555.0 | 14.5 |
| 3556.0 | 14.5 |
| 3557.0 | 14.5 |
| 3558.0 | 14.5 |
| 3559.0 | 14.5 |
| 3560.0 | 14.5 |
| 3561.0 | 14.5 |
| 3562.0 | 14.5 |
| 3563.0 | 14.5 |
| 3564.0 | 14.5 |
| 3565.0 | 14.5 |
| 3566.0 | 14.5 |
| 3567.0 | 14.5 |
| 3568.0 | 14.5 |
| 3569.0 | 14.5 |
| 3570.0 | 14.5 |
| 3571.0 | 14.5 |
| 3572.0 | 14.5 |
| 3573.0 | 14.5 |
| 3574.0 | 14.5 |
| 3575.0 | 14.5 |
| 3576.0 | 14.5 |
| 3577.0 | 14.5 |
| 3578.0 | 14.5 |
| 3579.0 | 14.5 |
| 3580.0 | 14.5 |
| 3581.0 | 14.5 |
| 3582.0 | 14.5 |
| 3583.0 | 14.5 |
| 3584.0 | 14.5 |
| 3585.0 | 14.5 |
| 3586.0 | 14.5 |
| 3587.0 | 14.5 |
| 3588.0 | 14.5 |
| 3589.0 | 14.5 |
| 3590.0 | 14.5 |
| 3591.0 | 14.5 |
| 3592.0 | 14.5 |
| 3593.0 | 14.5 |
| 3594.0 | 14.5 |
| 3595.0 | 14.5 |
| 3596.0 | 14.5 |
| 3597.0 | 14.5 |
| 3598.0 | 14.5 |
| 3599.0 | 14.5 |
| 3600.0 | 14.5 |
| 3601.0 | 14.5 |
| 3602.0 | 14.5 |
| 3603.0 | 14.5 |
| 3604.0 | 14.5 |
| 3605.0 | 14.5 |
| 3606.0 | 14.5 |
| 3607.0 | 14.5 |
| 3608.0 | 14.5 |
| 3609.0 | 14.5 |
| 3610.0 | 14.5 |
| 3611.0 | 14.5 |
| 3612.0 | 14.5 |
| 3613.0 | 14.5 |
| 3614.0 | 14.5 |
| 3615.0 | 14.5 |
| 3616.0 | 14.5 |
| 3617.0 | 14.5 |
| 3618.0 | 14.5 |
| 3619.0 | 14.5 |
| 3620.0 | 14.5 |
| 3621.0 | 14.5 |
| 3622.0 | 14.5 |
| 3623.0 | 14.5 |
| 3624.0 | 14.5 |
| 3625.0 | 14.5 |
| 3626.0 | 14.5 |
| 3627.0 | 14.5 |
| 3628.0 | 14.5 |
| 3629.0 | 14.5 |
| 3630.0 | 14.5 |
| 3631.0 | 14.5 |
| 3632.0 | 14.5 |
| 3633.0 | 14.5 |
| 3634.0 | 14.5 |
| 3635.0 | 14.5 |
| 3636.0 | 14.5 |
| 3637.0 | 14.5 |
| 3638.0 | 14.5 |
| 3639.0 | 14.5 |
| 3640.0 | 14.5 |
| 3641.0 | 14.5 |
| 3642.0 | 14.5 |
| 3643.0 | 14.5 |
| 3644.0 | 14.5 |
| 3645.0 | 14.5 |
| 3646.0 | 14.5 |
| 3647.0 | 14.5 |
| 3648.0 | 14.5 |
| 3649.0 | 14.5 |
| 3650.0 | 14.5 |
| 3651.0 | 14.5 |
| 3652.0 | 14.5 |
| 3653.0 | 14.5 |
| 3654.0 | 14.5 |
| 3655.0 | 14.5 |
| 3656.0 | 14.5 |
| 3657.0 | 14.5 |
| 3658.0 | 14.5 |
| 3659.0 | 14.5 |
| 3660.0 | 14.5 |
| 3661.0 | 14.5 |
| 3662.0 | 14.5 |
| 3663.0 | 14.5 |
| 3664.0 | 14.5 |
| 3665.0 | 14.5 |
| 3666.0 | 14.5 |
| 3667.0 | 14.5 |
| 3668.0 | 14.5 |
| 3669.0 | 14.5 |
| 3670.0 | 14.5 |
| 3671.0 | 14.5 |
| 3672.0 | 14.5 |
| 3673.0 | 14.5 |
| 3674.0 | 14.5 |
| 3675.0 | 14.5 |
| 3676.0 | 14.5 |
| 3677.0 | 14.5 |
| 3678.0 | 14.5 |
| 3679.0 | 14.5 |
| 3680.0 | 14.5 |
| 3681.0 | 14.5 |
| 3682.0 | 14.5 |
| 3683.0 | 14.5 |
| 3684.0 | 14.5 |
| 3685.0 | 14.5 |
| 3686.0 | 14.5 |
| 3687.0 | 14.5 |
| 3688.0 | 14.5 |
| 3689.0 | 14.5 |
| 3690.0 | 14.5 |
| 3691.0 | 14.5 |
| 3692.0 | 14.5 |
| 3693.0 | 14.5 |
| 3694.0 | 14.5 |
| 3695.0 | 14.5 |
| 3696.0 | 14.5 |
| 3697.0 | 14.5 |
| 3698.0 | 14.5 |
| 3699.0 | 14.5 |
| 3700.0 | 14.5 |
| 3701.0 | 14.5 |
| 3702.0 | 14.5 |
| 3703.0 | 14.5 |
| 3704.0 | 14.5 |
| 3705.0 | 14.5 |
| 3706.0 | 14.5 |
| 3707.0 | 14.5 |
| 3708.0 | 14.5 |
| 3709.0 | 14.5 |
| 3710.0 | 14.5 |
| 3711.0 | 14.5 |
| 3712.0 | 14.5 |
| 3713.0 | 14.5 |
| 3714.0 | 14.5 |
| 3715.0 | 14.5 |
| 3716.0 | 14.5 |
| 3717.0 | 14.5 |
| 3718.0 | 14.5 |
| 3719.0 | 14.5 |
| 3720.0 | 14.5 |
| 3721.0 | 14.5 |
| 3722.0 | 14.5 |
| 3723.0 | 14.5 |
| 3724.0 | 14.5 |
| 3725.0 | 14.5 |
| 3726.0 | 14.5 |
| 3727.0 | 14.5 |
| 3728.0 | 14.5 |
| 3729.0 | 14.5 |
| 3730.0 | 14.5 |
| 3731.0 | 14.5 |
| 3732.0 | 14.5 |
| 3733.0 | 14.5 |
| 3734.0 | 14.5 |
| 3735.0 | 14.5 |
| 3736.0 | 14.5 |
| 3737.0 | 14.5 |
| 3738.0 | 14.5 |
| 3739.0 | 14.5 |
| 3740.0 | 14.5 |
| 3741.0 | 14.5 |
| 3742.0 | 14.5 |
| 3743.0 | 14.5 |
| 3744.0 | 14.5 |
| 3745.0 | 14.5 |
| 3746.0 | 14.5 |
| 3747.0 | 14.5 |
| 3748.0 | 14.5 |
| 3749.0 | 14.5 |
| 3750.0 | 14.5 |
| 3751.0 | 14.5 |
| 3752.0 | 14.5 |
| 3753.0 | 14.5 |
| 3754.0 | 14.5 |
| 3755.0 | 14.5 |
| 3756.0 | 14.5 |
| 3757.0 | 14.5 |
| 3758.0 | 14.5 |
| 3759.0 | 14.5 |
| 3760.0 | 14.5 |
| 3761.0 | 14.5 |
| 3762.0 | 14.5 |
| 3763.0 | 14.5 |
| 3764.0 | 14.5 |
| 3765.0 | 14.5 |
| 3766.0 | 14.5 |
| 3767.0 | 14.5 |
| 3768.0 | 14.5 |
| 3769.0 | 14.5 |
| 3770.0 | 14.5 |
| 3771.0 | 14.5 |
| 3772.0 | 14.5 |
| 3773.0 | 14.5 |
| 3774.0 | 14.5 |
| 3775.0 | 14.5 |
| 3776.0 | 14.5 |
| 3777.0 | 14.5 |
| 3778.0 | 14.5 |
| 3779.0 | 14.5 |
| 3780.0 | 14.5 |
| 3781.0 | 14.5 |
| 3782.0 | 14.5 |
| 3783.0 | 14.5 |
| 3784.0 | 14.5 |
| 3785.0 | 14.5 |
| 3786.0 | 14.5 |
| 3787.0 | 14.5 |
| 3788.0 | 14.5 |
| 3789.0 | 14.5 |
| 3790.0 | 14.5 |
| 3791.0 | 14.5 |
| 3792.0 | 14.5 |
| 3793.0 | 14.5 |
| 3794.0 | 14.5 |
| 3795.0 | 14.5 |
| 3796.0 | 14.5 |
| 3797.0 | 14.5 |
| 3798.0 | 14.5 |
| 3799.0 | 14.5 |
| 3800.0 | 14.5 |
| 3801.0 | 14.5 |
| 3802.0 | 14.5 |
| 3803.0 | 14.5 |
| 3804.0 | 14.5 |
| 3805.0 | 14.5 |
| 3806.0 | 14.5 |
| 3807.0 | 14.5 |
| 3808.0 | 14.5 |
| 3809.0 | 14.5 |
| 3810.0 | 14.5 |
| 3811.0 | 14.5 |
| 3812.0 | 14.5 |
| 3813.0 | 14.5 |
| 3814.0 | 14.5 |
| 3815.0 | 14.5 |
| 3816.0 | 14.5 |
| 3817.0 | 14.5 |
| 3818.0 | 14.5 |
| 3819.0 | 14.5 |
| 3820.0 | 14.5 |
| 3821.0 | 14.5 |
| 3822.0 | 14.5 |
| 3823.0 | 14.5 |
| 3824.0 | 14.5 |
| 3825.0 | 14.5 |
| 3826.0 | 14.5 |
| 3827.0 | 14.5 |
| 3828.0 | 14.5 |
| 3829.0 | 14.5 |
| 3830.0 | 14.5 |
| 3831.0 | 14.5 |
| 3832.0 | 14.5 |
| 3833.0 | 14.5 |
| 3834.0 | 14.5 |
| 3835.0 | 14.5 |
| 3836.0 | 14.5 |
| 3837.0 | 14.5 |
| 3838.0 | 14.5 |
| 3839.0 | 14.5 |
| 3840.0 | 14.5 |
| 3841.0 | 14.5 |
| 3842.0 | 14.5 |
| 3843.0 | 14.5 |
| 3844.0 | 14.5 |
| 3845.0 | 14.5 |
| 3846.0 | 14.5 |
| 3847.0 | 14.5 |
| 3848.0 | 14.5 |
| 3849.0 | 14.5 |
| 3850.0 | 14.5 |
| 3851.0 | 14.5 |
| 3852.0 | 14.5 |
| 3853.0 | 14.5 |
| 3854.0 | 14.5 |
| 3855.0 | 14.5 |
| 3856.0 | 14.5 |
| 3857.0 | 14.5 |
| 3858.0 | 14.5 |
| 3859.0 | 14.5 |
| 3860.0 | 14.5 |
| 3861.0 | 14.5 |
| 3862.0 | 14.5 |
| 3863.0 | 14.5 |
| 3864.0 | 14.5 |
| 3865.0 | 14.5 |
| 3866.0 | 14.5 |
| 3867.0 | 14.5 |
| 3868.0 | 14.5 |
| 3869.0 | 14.5 |
| 3870.0 | 14.5 |
| 3871.0 | 14.5 |
| 3872.0 | 14.5 |
| 3873.0 | 14.5 |
| 3874.0 | 14.5 |
| 3875.0 | 14.5 |
| 3876.0 | 14.5 |
| 3877.0 | 14.5 |
| 3878.0 | 14.5 |
| 3879.0 | 14.5 |
| 3880.0 | 14.5 |
| 3881.0 | 14.5 |
| 3882.0 | 14.5 |
| 3883.0 | 14.5 |
| 3884.0 | 14.5 |
| 3885.0 | 14.5 |
| 3886.0 | 14.5 |
| 3887.0 | 14.5 |
| 3888.0 | 14.5 |
| 3889.0 | 14.5 |
| 3890.0 | 14.5 |
| 3891.0 | 14.5 |
| 3892.0 | 14.5 |
| 3893.0 | 14.5 |
| 3894.0 | 14.5 |
| 3895.0 | 14.5 |
| 3896.0 | 14.5 |
| 3897.0 | 14.5 |
| 3898.0 | 14.5 |
| 3899.0 | 14.5 |
| 3900.0 | 14.5 |
| 3901.0 | 14.5 |
| 3902.0 | 14.5 |
| 3903.0 | 14.5 |
| 3904.0 | 14.5 |
| 3905.0 | 14.5 |
| 3906.0 | 14.5 |
| 3907.0 | 14.5 |
| 3908.0 | 14.5 |
| 3909.0 | 14.5 |
| 3910.0 | 14.5 |
| 3911.0 | 14.5 |
| 3912.0 | 14.5 |
| 3913.0 | 14.5 |
| 3914.0 | 14.5 |
| 3915.0 | 14.5 |
| 3916.0 | 14.5 |
| 3917.0 | 14.5 |
| 3918.0 | 14.5 |
| 3919.0 | 14.5 |
| 3920.0 | 14.5 |
| 3921.0 | 14.5 |
| 3922.0 | 14.5 |
| 3923.0 | 14.5 |
| 3924.0 | 14.5 |
| 3925.0 | 14.5 |
| 3926.0 | 14.5 |
| 3927.0 | 14.5 |
| 3928.0 | 14.5 |
| 3929.0 | 14.5 |
| 3930.0 | 14.5 |
| 3931.0 | 14.5 |
| 3932.0 | 14.5 |
| 3933.0 | 14.5 |
| 3934.0 | 14.5 |
| 3935.0 | 14.5 |
| 3936.0 | 14.5 |
| 3937.0 | 14.5 |
| 3938.0 | 14.5 |
| 3939.0 | 14.5 |
| 3940.0 | 14.5 |
| 3941.0 | 14.5 |
| 3942.0 | 14.5 |
| 3943.0 | 14.5 |
| 3944.0 | 14.5 |
| 3945.0 | 14.5 |
| 3946.0 | 14.5 |
| 3947.0 | 14.5 |
| 3948.0 | 14.5 |
| 3949.0 | 14.5 |
| 3950.0 | 14.5 |
| 3951.0 | 14.5 |
| 3952.0 | 14.5 |
| 3953.0 | 14.5 |
| 3954.0 | 14.5 |
| 3955.0 | 14.5 |
| 3956.0 | 14.5 |
| 3957.0 | 14.5 |
| 3958.0 | 14.5 |
| 3959.0 | 14.5 |
| 3960.0 | 14.5 |
| 3961.0 | 14.5 |
| 3962.0 | 14.5 |
| 3963.0 | 14.5 |
| 3964.0 | 14.5 |
| 3965.0 | 14.5 |
| 3966.0 | 14.5 |
| 3967.0 | 14.5 |
| 3968.0 | 14.5 |
| 3969.0 | 14.5 |
| 3970.0 | 14.5 |
| 3971.0 | 14.5 |
| 3972.0 | 14.5 |
| 3973.0 | 14.5 |
| 3974.0 | 14.5 |
| 3975.0 | 14.5 |
| 3976.0 | 14.5 |
| 3977.0 | 14.5 |
| 3978.0 | 14.5 |
| 3979.0 | 14.5 |
| 3980.0 | 14.5 |
| 3981.0 | 14.5 |
| 3982.0 | 14.5 |
| 3983.0 | 14.5 |
| 3984.0 | 14.5 |
| 3985.0 | 14.5 |
| 3986.0 | 14.5 |
| 3987.0 | 14.5 |
| 3988.0 | 14.5 |
| 3989.0 | 14.5 |
| 3990.0 | 14.5 |
| 3991.0 | 14.5 |
| 3992.0 | 14.5 |
| 3993.0 | 14.5 |
| 3994.0 | 14.5 |
| 3995.0 | 14.5 |
| 3996.0 | 14.5 |
| 3997.0 | 14.5 |
| 3998.0 | 14.5 |
| 3999.0 | 14.5 |
| 4000.0 | 14.5 |
| 4001.0 | 14 |
| 4002.0 | 14 |
| 4003.0 | 14 |
| 4004.0 | 14 |
| 4005.0 | 14 |
| 4006.0 | 14 |
| 4007.0 | 14 |
| 4008.0 | 14 |
| 4009.0 | 14 |
| 4010.0 | 14 |
| 4011.0 | 14 |
| 4012.0 | 14 |
| 4013.0 | 14 |
| 4014.0 | 14 |
| 4015.0 | 14 |
| 4016.0 | 14 |
| 4017.0 | 14 |
| 4018.0 | 14 |
| 4019.0 | 14 |
| 4020.0 | 14 |
| 4021.0 | 14 |
| 4022.0 | 14 |
| 4023.0 | 14 |
| 4024.0 | 14 |
| 4025.0 | 14 |
| 4026.0 | 14 |
| 4027.0 | 14 |
| 4028.0 | 14 |
| 4029.0 | 14 |
| 4030.0 | 14 |
| 4031.0 | 14 |
| 4032.0 | 14 |
| 4033.0 | 14 |
| 4034.0 | 14 |
| 4035.0 | 14 |
| 4036.0 | 14 |
| 4037.0 | 14 |
| 4038.0 | 14 |
| 4039.0 | 14 |
| 4040.0 | 14 |
| 4041.0 | 14 |
| 4042.0 | 14 |
| 4043.0 | 14 |
| 4044.0 | 14 |
| 4045.0 | 14 |
| 4046.0 | 14 |
| 4047.0 | 14 |
| 4048.0 | 14 |
| 4049.0 | 14 |
| 4050.0 | 14 |
| 4051.0 | 14 |
| 4052.0 | 14 |
| 4053.0 | 14 |
| 4054.0 | 14 |
| 4055.0 | 14 |
| 4056.0 | 14 |
| 4057.0 | 14 |
| 4058.0 | 14 |
| 4059.0 | 14 |
| 4060.0 | 14 |
| 4061.0 | 14 |
| 4062.0 | 14 |
| 4063.0 | 14 |
| 4064.0 | 14 |
| 4065.0 | 14 |
| 4066.0 | 14 |
| 4067.0 | 14 |
| 4068.0 | 14 |
| 4069.0 | 14 |
| 4070.0 | 14 |
| 4071.0 | 14 |
| 4072.0 | 14 |
| 4073.0 | 14 |
| 4074.0 | 14 |
| 4075.0 | 14 |
| 4076.0 | 14 |
| 4077.0 | 14 |
| 4078.0 | 14 |
| 4079.0 | 14 |
| 4080.0 | 14 |
| 4081.0 | 14 |
| 4082.0 | 14 |
| 4083.0 | 14 |
| 4084.0 | 14 |
| 4085.0 | 14 |
| 4086.0 | 14 |
| 4087.0 | 14 |
| 4088.0 | 14 |
| 4089.0 | 14 |
| 4090.0 | 14 |
| 4091.0 | 14 |
| 4092.0 | 14 |
| 4093.0 | 14 |
| 4094.0 | 14 |
| 4095.0 | 14 |
| 4096.0 | 14 |
| 4097.0 | 14 |
| 4098.0 | 14 |
| 4099.0 | 14 |
| 4100.0 | 14 |
| 4101.0 | 14 |
| 4102.0 | 14 |
| 4103.0 | 14 |
| 4104.0 | 14 |
| 4105.0 | 14 |
| 4106.0 | 14 |
| 4107.0 | 14 |
| 4108.0 | 14 |
| 4109.0 | 14 |
| 4110.0 | 14 |
| 4111.0 | 14 |
| 4112.0 | 14 |
| 4113.0 | 14 |
| 4114.0 | 14 |
| 4115.0 | 14 |
| 4116.0 | 14 |
| 4117.0 | 14 |
| 4118.0 | 14 |
| 4119.0 | 14 |
| 4120.0 | 14 |
| 4121.0 | 14 |
| 4122.0 | 14 |
| 4123.0 | 14 |
| 4124.0 | 14 |
| 4125.0 | 14 |
| 4126.0 | 14 |
| 4127.0 | 14 |
| 4128.0 | 14 |
| 4129.0 | 14 |
| 4130.0 | 14 |
| 4131.0 | 14 |
| 4132.0 | 14 |
| 4133.0 | 14 |
| 4134.0 | 14 |
| 4135.0 | 14 |
| 4136.0 | 14 |
| 4137.0 | 14 |
| 4138.0 | 14 |
| 4139.0 | 14 |
| 4140.0 | 14 |
| 4141.0 | 14 |
| 4142.0 | 14 |
| 4143.0 | 14 |
| 4144.0 | 14 |
| 4145.0 | 14 |
| 4146.0 | 14 |
| 4147.0 | 14 |
| 4148.0 | 14 |
| 4149.0 | 14 |
| 4150.0 | 14 |
| 4151.0 | 14 |
| 4152.0 | 14 |
| 4153.0 | 14 |
| 4154.0 | 14 |
| 4155.0 | 14 |
| 4156.0 | 14 |
| 4157.0 | 14 |
| 4158.0 | 14 |
| 4159.0 | 14 |
| 4160.0 | 14 |
| 4161.0 | 14 |
| 4162.0 | 14 |
| 4163.0 | 14 |
| 4164.0 | 14 |
| 4165.0 | 14 |
| 4166.0 | 14 |
| 4167.0 | 14 |
| 4168.0 | 14 |
| 4169.0 | 14 |
| 4170.0 | 14 |
| 4171.0 | 14 |
| 4172.0 | 14 |
| 4173.0 | 14 |
| 4174.0 | 14 |
| 4175.0 | 14 |
| 4176.0 | 14 |
| 4177.0 | 14 |
| 4178.0 | 14 |
| 4179.0 | 14 |
| 4180.0 | 14 |
| 4181.0 | 14 |
| 4182.0 | 14 |
| 4183.0 | 14 |
| 4184.0 | 14 |
| 4185.0 | 14 |
| 4186.0 | 14 |
| 4187.0 | 14 |
| 4188.0 | 14 |
| 4189.0 | 14 |
| 4190.0 | 14 |
| 4191.0 | 14 |
| 4192.0 | 14 |
| 4193.0 | 14 |
| 4194.0 | 14 |
| 4195.0 | 14 |
| 4196.0 | 14 |
| 4197.0 | 14 |
| 4198.0 | 14 |
| 4199.0 | 14 |
| 4200.0 | 14 |
| 4201.0 | 14 |
| 4202.0 | 14 |
| 4203.0 | 14 |
| 4204.0 | 14 |
| 4205.0 | 14 |
| 4206.0 | 14 |
| 4207.0 | 14 |
| 4208.0 | 14 |
| 4209.0 | 14 |
| 4210.0 | 14 |
| 4211.0 | 14 |
| 4212.0 | 14 |
| 4213.0 | 14 |
| 4214.0 | 14 |
| 4215.0 | 14 |
| 4216.0 | 14 |
| 4217.0 | 14 |
| 4218.0 | 14 |
| 4219.0 | 14 |
| 4220.0 | 14 |
| 4221.0 | 14 |
| 4222.0 | 14 |
| 4223.0 | 14 |
| 4224.0 | 14 |
| 4225.0 | 14 |
| 4226.0 | 14 |
| 4227.0 | 14 |
| 4228.0 | 14 |
| 4229.0 | 14 |
| 4230.0 | 14 |
| 4231.0 | 14 |
| 4232.0 | 14 |
| 4233.0 | 14 |
| 4234.0 | 14 |
| 4235.0 | 14 |
| 4236.0 | 14 |
| 4237.0 | 14 |
| 4238.0 | 14 |
| 4239.0 | 14 |
| 4240.0 | 14 |
| 4241.0 | 14 |
| 4242.0 | 14 |
| 4243.0 | 14 |
| 4244.0 | 14 |
| 4245.0 | 14 |
| 4246.0 | 14 |
| 4247.0 | 14 |
| 4248.0 | 14 |
| 4249.0 | 14 |
| 4250.0 | 14 |
| 4251.0 | 14 |
| 4252.0 | 14 |
| 4253.0 | 14 |
| 4254.0 | 14 |
| 4255.0 | 14 |
| 4256.0 | 14 |
| 4257.0 | 14 |
| 4258.0 | 14 |
| 4259.0 | 14 |
| 4260.0 | 14 |
| 4261.0 | 14 |
| 4262.0 | 14 |
| 4263.0 | 14 |
| 4264.0 | 14 |
| 4265.0 | 14 |
| 4266.0 | 14 |
| 4267.0 | 14 |
| 4268.0 | 14 |
| 4269.0 | 14 |
| 4270.0 | 14 |
| 4271.0 | 14 |
| 4272.0 | 14 |
| 4273.0 | 14 |
| 4274.0 | 14 |
| 4275.0 | 14 |
| 4276.0 | 14 |
| 4277.0 | 14 |
| 4278.0 | 14 |
| 4279.0 | 14 |
| 4280.0 | 14 |
| 4281.0 | 14 |
| 4282.0 | 14 |
| 4283.0 | 14 |
| 4284.0 | 14 |
| 4285.0 | 14 |
| 4286.0 | 14 |
| 4287.0 | 14 |
| 4288.0 | 14 |
| 4289.0 | 14 |
| 4290.0 | 14 |
| 4291.0 | 14 |
| 4292.0 | 14 |
| 4293.0 | 14 |
| 4294.0 | 14 |
| 4295.0 | 14 |
| 4296.0 | 14 |
| 4297.0 | 14 |
| 4298.0 | 14 |
| 4299.0 | 14 |
| 4300.0 | 14 |
| 4301.0 | 14 |
| 4302.0 | 14 |
| 4303.0 | 14 |
| 4304.0 | 14 |
| 4305.0 | 14 |
| 4306.0 | 14 |
| 4307.0 | 14 |
| 4308.0 | 14 |
| 4309.0 | 14 |
| 4310.0 | 14 |
| 4311.0 | 14 |
| 4312.0 | 14 |
| 4313.0 | 14 |
| 4314.0 | 14 |
| 4315.0 | 14 |
| 4316.0 | 14 |
| 4317.0 | 14 |
| 4318.0 | 14 |
| 4319.0 | 14 |
| 4320.0 | 14 |
| 4321.0 | 14 |
| 4322.0 | 14 |
| 4323.0 | 14 |
| 4324.0 | 14 |
| 4325.0 | 14 |
| 4326.0 | 14 |
| 4327.0 | 14 |
| 4328.0 | 14 |
| 4329.0 | 14 |
| 4330.0 | 14 |
| 4331.0 | 14 |
| 4332.0 | 14 |
| 4333.0 | 14 |
| 4334.0 | 14 |
| 4335.0 | 14 |
| 4336.0 | 14 |
| 4337.0 | 14 |
| 4338.0 | 14 |
| 4339.0 | 14 |
| 4340.0 | 14 |
| 4341.0 | 14 |
| 4342.0 | 14 |
| 4343.0 | 14 |
| 4344.0 | 14 |
| 4345.0 | 14 |
| 4346.0 | 14 |
| 4347.0 | 14 |
| 4348.0 | 14 |
| 4349.0 | 14 |
| 4350.0 | 14 |
| 4351.0 | 14 |
| 4352.0 | 14 |
| 4353.0 | 14 |
| 4354.0 | 14 |
| 4355.0 | 14 |
| 4356.0 | 14 |
| 4357.0 | 14 |
| 4358.0 | 14 |
| 4359.0 | 14 |
| 4360.0 | 14 |
| 4361.0 | 14 |
| 4362.0 | 14 |
| 4363.0 | 14 |
| 4364.0 | 14 |
| 4365.0 | 14 |
| 4366.0 | 14 |
| 4367.0 | 14 |
| 4368.0 | 14 |
| 4369.0 | 14 |
| 4370.0 | 14 |
| 4371.0 | 14 |
| 4372.0 | 14 |
| 4373.0 | 14 |
| 4374.0 | 14 |
| 4375.0 | 14 |
| 4376.0 | 14 |
| 4377.0 | 14 |
| 4378.0 | 14 |
| 4379.0 | 14 |
| 4380.0 | 14 |
| 4381.0 | 14 |
| 4382.0 | 14 |
| 4383.0 | 14 |
| 4384.0 | 14 |
| 4385.0 | 14 |
| 4386.0 | 14 |
| 4387.0 | 14 |
| 4388.0 | 14 |
| 4389.0 | 14 |
| 4390.0 | 14 |
| 4391.0 | 14 |
| 4392.0 | 14 |
| 4393.0 | 14 |
| 4394.0 | 14 |
| 4395.0 | 14 |
| 4396.0 | 14 |
| 4397.0 | 14 |
| 4398.0 | 14 |
| 4399.0 | 14 |
| 4400.0 | 14 |
| 4401.0 | 14 |
| 4402.0 | 14 |
| 4403.0 | 14 |
| 4404.0 | 14 |
| 4405.0 | 14 |
| 4406.0 | 14 |
| 4407.0 | 14 |
| 4408.0 | 14 |
| 4409.0 | 14 |
| 4410.0 | 14 |
| 4411.0 | 14 |
| 4412.0 | 14 |
| 4413.0 | 14 |
| 4414.0 | 14 |
| 4415.0 | 14 |
| 4416.0 | 14 |
| 4417.0 | 14 |
| 4418.0 | 14 |
| 4419.0 | 14 |
| 4420.0 | 14 |
| 4421.0 | 14 |
| 4422.0 | 14 |
| 4423.0 | 14 |
| 4424.0 | 14 |
| 4425.0 | 14 |
| 4426.0 | 14 |
| 4427.0 | 14 |
| 4428.0 | 14 |
| 4429.0 | 14 |
| 4430.0 | 14 |
| 4431.0 | 14 |
| 4432.0 | 14 |
| 4433.0 | 14 |
| 4434.0 | 14 |
| 4435.0 | 14 |
| 4436.0 | 14 |
| 4437.0 | 14 |
| 4438.0 | 14 |
| 4439.0 | 14 |
| 4440.0 | 14 |
| 4441.0 | 14 |
| 4442.0 | 14 |
| 4443.0 | 14 |
| 4444.0 | 14 |
| 4445.0 | 14 |
| 4446.0 | 14 |
| 4447.0 | 14 |
| 4448.0 | 14 |
| 4449.0 | 14 |
| 4450.0 | 14 |
| 4451.0 | 14 |
| 4452.0 | 14 |
| 4453.0 | 14 |
| 4454.0 | 14 |
| 4455.0 | 14 |
| 4456.0 | 14 |
| 4457.0 | 14 |
| 4458.0 | 14 |
| 4459.0 | 14 |
| 4460.0 | 14 |
| 4461.0 | 14 |
| 4462.0 | 14 |
| 4463.0 | 14 |
| 4464.0 | 14 |
| 4465.0 | 14 |
| 4466.0 | 14 |
| 4467.0 | 14 |
| 4468.0 | 14 |
| 4469.0 | 14 |
| 4470.0 | 14 |
| 4471.0 | 14 |
| 4472.0 | 14 |
| 4473.0 | 14 |
| 4474.0 | 14 |
| 4475.0 | 14 |
| 4476.0 | 14 |
| 4477.0 | 14 |
| 4478.0 | 14 |
| 4479.0 | 14 |
| 4480.0 | 14 |
| 4481.0 | 14 |
| 4482.0 | 14 |
| 4483.0 | 14 |
| 4484.0 | 14 |
| 4485.0 | 14 |
| 4486.0 | 14 |
| 4487.0 | 14 |
| 4488.0 | 14 |
| 4489.0 | 14 |
| 4490.0 | 14 |
| 4491.0 | 14 |
| 4492.0 | 14 |
| 4493.0 | 14 |
| 4494.0 | 14 |
| 4495.0 | 14 |
| 4496.0 | 14 |
| 4497.0 | 14 |
| 4498.0 | 14 |
| 4499.0 | 14 |
| 4500.0 | 14 |
| 4501.0 | 14 |
| 4502.0 | 14 |
| 4503.0 | 14 |
| 4504.0 | 14 |
| 4505.0 | 14 |
| 4506.0 | 14 |
| 4507.0 | 14 |
| 4508.0 | 14 |
| 4509.0 | 14 |
| 4510.0 | 14 |
| 4511.0 | 14 |
| 4512.0 | 14 |
| 4513.0 | 14 |
| 4514.0 | 14 |
| 4515.0 | 14 |
| 4516.0 | 14 |
| 4517.0 | 14 |
| 4518.0 | 14 |
| 4519.0 | 14 |
| 4520.0 | 14 |
| 4521.0 | 14 |
| 4522.0 | 14 |
| 4523.0 | 14 |
| 4524.0 | 14 |
| 4525.0 | 14 |
| 4526.0 | 14 |
| 4527.0 | 14 |
| 4528.0 | 14 |
| 4529.0 | 14 |
| 4530.0 | 14 |
| 4531.0 | 14 |
| 4532.0 | 14 |
| 4533.0 | 14 |
| 4534.0 | 14 |
| 4535.0 | 14 |
| 4536.0 | 14 |
| 4537.0 | 14 |
| 4538.0 | 14 |
| 4539.0 | 14 |
| 4540.0 | 14 |
| 4541.0 | 14 |
| 4542.0 | 14 |
| 4543.0 | 14 |
| 4544.0 | 14 |
| 4545.0 | 14 |
| 4546.0 | 14 |
| 4547.0 | 14 |
| 4548.0 | 14 |
| 4549.0 | 14 |
| 4550.0 | 14 |
| 4551.0 | 14 |
| 4552.0 | 14 |
| 4553.0 | 14 |
| 4554.0 | 14 |
| 4555.0 | 14 |
| 4556.0 | 14 |
| 4557.0 | 14 |
| 4558.0 | 14 |
| 4559.0 | 14 |
| 4560.0 | 14 |
| 4561.0 | 14 |
| 4562.0 | 14 |
| 4563.0 | 14 |
| 4564.0 | 14 |
| 4565.0 | 14 |
| 4566.0 | 14 |
| 4567.0 | 14 |
| 4568.0 | 14 |
| 4569.0 | 14 |
| 4570.0 | 14 |
| 4571.0 | 14 |
| 4572.0 | 14 |
| 4573.0 | 14 |
| 4574.0 | 14 |
| 4575.0 | 14 |
| 4576.0 | 14 |
| 4577.0 | 14 |
| 4578.0 | 14 |
| 4579.0 | 14 |
| 4580.0 | 14 |
| 4581.0 | 14 |
| 4582.0 | 14 |
| 4583.0 | 14 |
| 4584.0 | 14 |
| 4585.0 | 14 |
| 4586.0 | 14 |
| 4587.0 | 14 |
| 4588.0 | 14 |
| 4589.0 | 14 |
| 4590.0 | 14 |
| 4591.0 | 14 |
| 4592.0 | 14 |
| 4593.0 | 14 |
| 4594.0 | 14 |
| 4595.0 | 14 |
| 4596.0 | 14 |
| 4597.0 | 14 |
| 4598.0 | 14 |
| 4599.0 | 14 |
| 4600.0 | 14 |
| 4601.0 | 14 |
| 4602.0 | 14 |
| 4603.0 | 14 |
| 4604.0 | 14 |
| 4605.0 | 14 |
| 4606.0 | 14 |
| 4607.0 | 14 |
| 4608.0 | 14 |
| 4609.0 | 14 |
| 4610.0 | 14 |
| 4611.0 | 14 |
| 4612.0 | 14 |
| 4613.0 | 14 |
| 4614.0 | 14 |
| 4615.0 | 14 |
| 4616.0 | 14 |
| 4617.0 | 14 |
| 4618.0 | 14 |
| 4619.0 | 14 |
| 4620.0 | 14 |
| 4621.0 | 14 |
| 4622.0 | 14 |
| 4623.0 | 14 |
| 4624.0 | 14 |
| 4625.0 | 14 |
| 4626.0 | 14 |
| 4627.0 | 14 |
| 4628.0 | 14 |
| 4629.0 | 14 |
| 4630.0 | 14 |
| 4631.0 | 14 |
| 4632.0 | 14 |
| 4633.0 | 14 |
| 4634.0 | 14 |
| 4635.0 | 14 |
| 4636.0 | 14 |
| 4637.0 | 14 |
| 4638.0 | 14 |
| 4639.0 | 14 |
| 4640.0 | 14 |
| 4641.0 | 14 |
| 4642.0 | 14 |
| 4643.0 | 14 |
| 4644.0 | 14 |
| 4645.0 | 14 |
| 4646.0 | 14 |
| 4647.0 | 14 |
| 4648.0 | 14 |
| 4649.0 | 14 |
| 4650.0 | 14 |
| 4651.0 | 14 |
| 4652.0 | 14 |
| 4653.0 | 14 |
| 4654.0 | 14 |
| 4655.0 | 14 |
| 4656.0 | 14 |
| 4657.0 | 14 |
| 4658.0 | 14 |
| 4659.0 | 14 |
| 4660.0 | 14 |
| 4661.0 | 14 |
| 4662.0 | 14 |
| 4663.0 | 14 |
| 4664.0 | 14 |
| 4665.0 | 14 |
| 4666.0 | 14 |
| 4667.0 | 14 |
| 4668.0 | 14 |
| 4669.0 | 14 |
| 4670.0 | 14 |
| 4671.0 | 14 |
| 4672.0 | 14 |
| 4673.0 | 14 |
| 4674.0 | 14 |
| 4675.0 | 14 |
| 4676.0 | 14 |
| 4677.0 | 14 |
| 4678.0 | 14 |
| 4679.0 | 14 |
| 4680.0 | 14 |
| 4681.0 | 14 |
| 4682.0 | 14 |
| 4683.0 | 14 |
| 4684.0 | 14 |
| 4685.0 | 14 |
| 4686.0 | 14 |
| 4687.0 | 14 |
| 4688.0 | 14 |
| 4689.0 | 14 |
| 4690.0 | 14 |
| 4691.0 | 14 |
| 4692.0 | 14 |
| 4693.0 | 14 |
| 4694.0 | 14 |
| 4695.0 | 14 |
| 4696.0 | 14 |
| 4697.0 | 14 |
| 4698.0 | 14 |
| 4699.0 | 14 |
| 4700.0 | 14 |
| 4701.0 | 14 |
| 4702.0 | 14 |
| 4703.0 | 14 |
| 4704.0 | 14 |
| 4705.0 | 14 |
| 4706.0 | 14 |
| 4707.0 | 14 |
| 4708.0 | 14 |
| 4709.0 | 14 |
| 4710.0 | 14 |
| 4711.0 | 14 |
| 4712.0 | 14 |
| 4713.0 | 14 |
| 4714.0 | 14 |
| 4715.0 | 14 |
| 4716.0 | 14 |
| 4717.0 | 14 |
| 4718.0 | 14 |
| 4719.0 | 14 |
| 4720.0 | 14 |
| 4721.0 | 14 |
| 4722.0 | 14 |
| 4723.0 | 14 |
| 4724.0 | 14 |
| 4725.0 | 14 |
| 4726.0 | 14 |
| 4727.0 | 14 |
| 4728.0 | 14 |
| 4729.0 | 14 |
| 4730.0 | 14 |
| 4731.0 | 14 |
| 4732.0 | 14 |
| 4733.0 | 14 |
| 4734.0 | 14 |
| 4735.0 | 14 |
| 4736.0 | 14 |
| 4737.0 | 14 |
| 4738.0 | 14 |
| 4739.0 | 14 |
| 4740.0 | 14 |
| 4741.0 | 14 |
| 4742.0 | 14 |
| 4743.0 | 14 |
| 4744.0 | 14 |
| 4745.0 | 14 |
| 4746.0 | 14 |
| 4747.0 | 14 |
| 4748.0 | 14 |
| 4749.0 | 14 |
| 4750.0 | 14 |
| 4751.0 | 14 |
| 4752.0 | 14 |
| 4753.0 | 14 |
| 4754.0 | 14 |
| 4755.0 | 14 |
| 4756.0 | 14 |
| 4757.0 | 14 |
| 4758.0 | 14 |
| 4759.0 | 14 |
| 4760.0 | 14 |
| 4761.0 | 14 |
| 4762.0 | 14 |
| 4763.0 | 14 |
| 4764.0 | 14 |
| 4765.0 | 14 |
| 4766.0 | 14 |
| 4767.0 | 14 |
| 4768.0 | 14 |
| 4769.0 | 14 |
| 4770.0 | 14 |
| 4771.0 | 14 |
| 4772.0 | 14 |
| 4773.0 | 14 |
| 4774.0 | 14 |
| 4775.0 | 14 |
| 4776.0 | 14 |
| 4777.0 | 14 |
| 4778.0 | 14 |
| 4779.0 | 14 |
| 4780.0 | 14 |
| 4781.0 | 14 |
| 4782.0 | 14 |
| 4783.0 | 14 |
| 4784.0 | 14 |
| 4785.0 | 14 |
| 4786.0 | 14 |
| 4787.0 | 14 |
| 4788.0 | 14 |
| 4789.0 | 14 |
| 4790.0 | 14 |
| 4791.0 | 14 |
| 4792.0 | 14 |
| 4793.0 | 14 |
| 4794.0 | 14 |
| 4795.0 | 14 |
| 4796.0 | 14 |
| 4797.0 | 14 |
| 4798.0 | 14 |
| 4799.0 | 14 |
| 4800.0 | 14 |
| 4801.0 | 14 |
| 4802.0 | 14 |
| 4803.0 | 14 |
| 4804.0 | 14 |
| 4805.0 | 14 |
| 4806.0 | 14 |
| 4807.0 | 14 |
| 4808.0 | 14 |
| 4809.0 | 14 |
| 4810.0 | 14 |
| 4811.0 | 14 |
| 4812.0 | 14 |
| 4813.0 | 14 |
| 4814.0 | 14 |
| 4815.0 | 14 |
| 4816.0 | 14 |
| 4817.0 | 14 |
| 4818.0 | 14 |
| 4819.0 | 14 |
| 4820.0 | 14 |
| 4821.0 | 14 |
| 4822.0 | 14 |
| 4823.0 | 14 |
| 4824.0 | 14 |
| 4825.0 | 14 |
| 4826.0 | 14 |
| 4827.0 | 14 |
| 4828.0 | 14 |
| 4829.0 | 14 |
| 4830.0 | 14 |
| 4831.0 | 14 |
| 4832.0 | 14 |
| 4833.0 | 14 |
| 4834.0 | 14 |
| 4835.0 | 14 |
| 4836.0 | 14 |
| 4837.0 | 14 |
| 4838.0 | 14 |
| 4839.0 | 14 |
| 4840.0 | 14 |
| 4841.0 | 14 |
| 4842.0 | 14 |
| 4843.0 | 14 |
| 4844.0 | 14 |
| 4845.0 | 14 |
| 4846.0 | 14 |
| 4847.0 | 14 |
| 4848.0 | 14 |
| 4849.0 | 14 |
| 4850.0 | 14 |
| 4851.0 | 14 |
| 4852.0 | 14 |
| 4853.0 | 14 |
| 4854.0 | 14 |
| 4855.0 | 14 |
| 4856.0 | 14 |
| 4857.0 | 14 |
| 4858.0 | 14 |
| 4859.0 | 14 |
| 4860.0 | 14 |
| 4861.0 | 14 |
| 4862.0 | 14 |
| 4863.0 | 14 |
| 4864.0 | 14 |
| 4865.0 | 14 |
| 4866.0 | 14 |
| 4867.0 | 14 |
| 4868.0 | 14 |
| 4869.0 | 14 |
| 4870.0 | 14 |
| 4871.0 | 14 |
| 4872.0 | 14 |
| 4873.0 | 14 |
| 4874.0 | 14 |
| 4875.0 | 14 |
| 4876.0 | 14 |
| 4877.0 | 14 |
| 4878.0 | 14 |
| 4879.0 | 14 |
| 4880.0 | 14 |
| 4881.0 | 14 |
| 4882.0 | 14 |
| 4883.0 | 14 |
| 4884.0 | 14 |
| 4885.0 | 14 |
| 4886.0 | 14 |
| 4887.0 | 14 |
| 4888.0 | 14 |
| 4889.0 | 14 |
| 4890.0 | 14 |
| 4891.0 | 14 |
| 4892.0 | 14 |
| 4893.0 | 14 |
| 4894.0 | 14 |
| 4895.0 | 14 |
| 4896.0 | 14 |
| 4897.0 | 14 |
| 4898.0 | 14 |
| 4899.0 | 14 |
| 4900.0 | 14 |
| 4901.0 | 14 |
| 4902.0 | 14 |
| 4903.0 | 14 |
| 4904.0 | 14 |
| 4905.0 | 14 |
| 4906.0 | 14 |
| 4907.0 | 14 |
| 4908.0 | 14 |
| 4909.0 | 14 |
| 4910.0 | 14 |
| 4911.0 | 14 |
| 4912.0 | 14 |
| 4913.0 | 14 |
| 4914.0 | 14 |
| 4915.0 | 14 |
| 4916.0 | 14 |
| 4917.0 | 14 |
| 4918.0 | 14 |
| 4919.0 | 14 |
| 4920.0 | 14 |
| 4921.0 | 14 |
| 4922.0 | 14 |
| 4923.0 | 14 |
| 4924.0 | 14 |
| 4925.0 | 14 |
| 4926.0 | 14 |
| 4927.0 | 14 |
| 4928.0 | 14 |
| 4929.0 | 14 |
| 4930.0 | 14 |
| 4931.0 | 14 |
| 4932.0 | 14 |
| 4933.0 | 14 |
| 4934.0 | 14 |
| 4935.0 | 14 |
| 4936.0 | 14 |
| 4937.0 | 14 |
| 4938.0 | 14 |
| 4939.0 | 14 |
| 4940.0 | 14 |
| 4941.0 | 14 |
| 4942.0 | 14 |
| 4943.0 | 14 |
| 4944.0 | 14 |
| 4945.0 | 14 |
| 4946.0 | 14 |
| 4947.0 | 14 |
| 4948.0 | 14 |
| 4949.0 | 14 |
| 4950.0 | 14 |
| 4951.0 | 14 |
| 4952.0 | 14 |
| 4953.0 | 14 |
| 4954.0 | 14 |
| 4955.0 | 14 |
| 4956.0 | 14 |
| 4957.0 | 14 |
| 4958.0 | 14 |
| 4959.0 | 14 |
| 4960.0 | 14 |
| 4961.0 | 14 |
| 4962.0 | 14 |
| 4963.0 | 14 |
| 4964.0 | 14 |
| 4965.0 | 14 |
| 4966.0 | 14 |
| 4967.0 | 14 |
| 4968.0 | 14 |
| 4969.0 | 14 |
| 4970.0 | 14 |
| 4971.0 | 14 |
| 4972.0 | 14 |
| 4973.0 | 14 |
| 4974.0 | 14 |
| 4975.0 | 14 |
| 4976.0 | 14 |
| 4977.0 | 14 |
| 4978.0 | 14 |
| 4979.0 | 14 |
| 4980.0 | 14 |
| 4981.0 | 14 |
| 4982.0 | 14 |
| 4983.0 | 14 |
| 4984.0 | 14 |
| 4985.0 | 14 |
| 4986.0 | 14 |
| 4987.0 | 14 |
| 4988.0 | 14 |
| 4989.0 | 14 |
| 4990.0 | 14 |
| 4991.0 | 14 |
| 4992.0 | 14 |
| 4993.0 | 14 |
| 4994.0 | 14 |
| 4995.0 | 14 |
| 4996.0 | 14 |
| 4997.0 | 14 |
| 4998.0 | 14 |
| 4999.0 | 14 |
| 5000.0 | 14 |
| 5001.0 | 14 |
| 5002.0 | 14 |
| 5003.0 | 14 |
| 5004.0 | 14 |
| 5005.0 | 14 |
| 5006.0 | 14 |
| 5007.0 | 14 |
| 5008.0 | 14 |
| 5009.0 | 14 |
| 5010.0 | 14 |
| 5011.0 | 14 |
| 5012.0 | 14 |
| 5013.0 | 14 |
| 5014.0 | 14 |
| 5015.0 | 14 |
| 5016.0 | 14 |
| 5017.0 | 14 |
| 5018.0 | 14 |
| 5019.0 | 14 |
| 5020.0 | 14 |
| 5021.0 | 14 |
| 5022.0 | 14 |
| 5023.0 | 14 |
| 5024.0 | 14 |
| 5025.0 | 14 |
| 5026.0 | 14 |
| 5027.0 | 14 |
| 5028.0 | 14 |
| 5029.0 | 14 |
| 5030.0 | 14 |
| 5031.0 | 14 |
| 5032.0 | 14 |
| 5033.0 | 14 |
| 5034.0 | 14 |
| 5035.0 | 14 |
| 5036.0 | 14 |
| 5037.0 | 14 |
| 5038.0 | 14 |
| 5039.0 | 14 |
| 5040.0 | 14 |
| 5041.0 | 14 |
| 5042.0 | 14 |
| 5043.0 | 14 |
| 5044.0 | 14 |
| 5045.0 | 14 |
| 5046.0 | 14 |
| 5047.0 | 14 |
| 5048.0 | 14 |
| 5049.0 | 14 |
| 5050.0 | 14 |
| 5051.0 | 14 |
| 5052.0 | 14 |
| 5053.0 | 14 |
| 5054.0 | 14 |
| 5055.0 | 14 |
| 5056.0 | 14 |
| 5057.0 | 14 |
| 5058.0 | 14 |
| 5059.0 | 14 |
| 5060.0 | 14 |
| 5061.0 | 14 |
| 5062.0 | 14 |
| 5063.0 | 14 |
| 5064.0 | 14 |
| 5065.0 | 14 |
| 5066.0 | 14 |
| 5067.0 | 14 |
| 5068.0 | 14 |
| 5069.0 | 14 |
| 5070.0 | 14 |
| 5071.0 | 14 |
| 5072.0 | 14 |
| 5073.0 | 14 |
| 5074.0 | 14 |
| 5075.0 | 14 |
| 5076.0 | 14 |
| 5077.0 | 14 |
| 5078.0 | 14 |
| 5079.0 | 14 |
| 5080.0 | 14 |
| 5081.0 | 14 |
| 5082.0 | 14 |
| 5083.0 | 14 |
| 5084.0 | 14 |
| 5085.0 | 14 |
| 5086.0 | 14 |
| 5087.0 | 14 |
| 5088.0 | 14 |
| 5089.0 | 14 |
| 5090.0 | 14 |
| 5091.0 | 14 |
| 5092.0 | 14 |
| 5093.0 | 14 |
| 5094.0 | 14 |
| 5095.0 | 14 |
| 5096.0 | 14 |
| 5097.0 | 14 |
| 5098.0 | 14 |
| 5099.0 | 14 |
| 5100.0 | 14 |
| 5101.0 | 14 |
| 5102.0 | 14 |
| 5103.0 | 14 |
| 5104.0 | 14 |
| 5105.0 | 14 |
| 5106.0 | 14 |
| 5107.0 | 14 |
| 5108.0 | 14 |
| 5109.0 | 14 |
| 5110.0 | 14 |
| 5111.0 | 14 |
| 5112.0 | 14 |
| 5113.0 | 14 |
| 5114.0 | 14 |
| 5115.0 | 14 |
| 5116.0 | 14 |
| 5117.0 | 14 |
| 5118.0 | 14 |
| 5119.0 | 14 |
| 5120.0 | 14 |
| 5121.0 | 14 |
| 5122.0 | 14 |
| 5123.0 | 14 |
| 5124.0 | 14 |
| 5125.0 | 14 |
| 5126.0 | 14 |
| 5127.0 | 14 |
| 5128.0 | 14 |
| 5129.0 | 14 |
| 5130.0 | 14 |
| 5131.0 | 14 |
| 5132.0 | 14 |
| 5133.0 | 14 |
| 5134.0 | 14 |
| 5135.0 | 14 |
| 5136.0 | 14 |
| 5137.0 | 14 |
| 5138.0 | 14 |
| 5139.0 | 14 |
| 5140.0 | 14 |
| 5141.0 | 14 |
| 5142.0 | 14 |
| 5143.0 | 14 |
| 5144.0 | 14 |
| 5145.0 | 14 |
| 5146.0 | 14 |
| 5147.0 | 14 |
| 5148.0 | 14 |
| 5149.0 | 14 |
| 5150.0 | 14 |
| 5151.0 | 14 |
| 5152.0 | 14 |
| 5153.0 | 14 |
| 5154.0 | 14 |
| 5155.0 | 14 |
| 5156.0 | 14 |
| 5157.0 | 14 |
| 5158.0 | 14 |
| 5159.0 | 14 |
| 5160.0 | 14 |
| 5161.0 | 14 |
| 5162.0 | 14 |
| 5163.0 | 14 |
| 5164.0 | 14 |
| 5165.0 | 14 |
| 5166.0 | 14 |
| 5167.0 | 14 |
| 5168.0 | 14 |
| 5169.0 | 14 |
| 5170.0 | 14 |
| 5171.0 | 14 |
| 5172.0 | 14 |
| 5173.0 | 14 |
| 5174.0 | 14 |
| 5175.0 | 14 |
| 5176.0 | 14 |
| 5177.0 | 14 |
| 5178.0 | 14 |
| 5179.0 | 14 |
| 5180.0 | 14 |
| 5181.0 | 14 |
| 5182.0 | 14 |
| 5183.0 | 14 |
| 5184.0 | 14 |
| 5185.0 | 14 |
| 5186.0 | 14 |
| 5187.0 | 14 |
| 5188.0 | 14 |
| 5189.0 | 14 |
| 5190.0 | 14 |
| 5191.0 | 14 |
| 5192.0 | 14 |
| 5193.0 | 14 |
| 5194.0 | 14 |
| 5195.0 | 14 |
| 5196.0 | 14 |
| 5197.0 | 14 |
| 5198.0 | 14 |
| 5199.0 | 14 |
| 5200.0 | 14 |
| 5201.0 | 14 |
| 5202.0 | 14 |
| 5203.0 | 14 |
| 5204.0 | 14 |
| 5205.0 | 14 |
| 5206.0 | 14 |
| 5207.0 | 14 |
| 5208.0 | 14 |
| 5209.0 | 14 |
| 5210.0 | 14 |
| 5211.0 | 14 |
| 5212.0 | 14 |
| 5213.0 | 14 |
| 5214.0 | 14 |
| 5215.0 | 14 |
| 5216.0 | 14 |
| 5217.0 | 14 |
| 5218.0 | 14 |
| 5219.0 | 14 |
| 5220.0 | 14 |
| 5221.0 | 14 |
| 5222.0 | 14 |
| 5223.0 | 14 |
| 5224.0 | 14 |
| 5225.0 | 14 |
| 5226.0 | 14 |
| 5227.0 | 14 |
| 5228.0 | 14 |
| 5229.0 | 14 |
| 5230.0 | 14 |
| 5231.0 | 14 |
| 5232.0 | 14 |
| 5233.0 | 14 |
| 5234.0 | 14 |
| 5235.0 | 14 |
| 5236.0 | 14 |
| 5237.0 | 14 |
| 5238.0 | 14 |
| 5239.0 | 14 |
| 5240.0 | 14 |
| 5241.0 | 14 |
| 5242.0 | 14 |
| 5243.0 | 14 |
| 5244.0 | 14 |
| 5245.0 | 14 |
| 5246.0 | 14 |
| 5247.0 | 14 |
| 5248.0 | 14 |
| 5249.0 | 14 |
| 5250.0 | 14 |
| 5251.0 | 14 |
| 5252.0 | 14 |
| 5253.0 | 14 |
| 5254.0 | 14 |
| 5255.0 | 14 |
| 5256.0 | 14 |
| 5257.0 | 14 |
| 5258.0 | 14 |
| 5259.0 | 14 |
| 5260.0 | 14 |
| 5261.0 | 14 |
| 5262.0 | 14 |
| 5263.0 | 14 |
| 5264.0 | 14 |
| 5265.0 | 14 |
| 5266.0 | 14 |
| 5267.0 | 14 |
| 5268.0 | 14 |
| 5269.0 | 14 |
| 5270.0 | 14 |
| 5271.0 | 14 |
| 5272.0 | 14 |
| 5273.0 | 14 |
| 5274.0 | 14 |
| 5275.0 | 14 |
| 5276.0 | 14 |
| 5277.0 | 14 |
| 5278.0 | 14 |
| 5279.0 | 14 |
| 5280.0 | 14 |
| 5281.0 | 14 |
| 5282.0 | 14 |
| 5283.0 | 14 |
| 5284.0 | 14 |
| 5285.0 | 14 |
| 5286.0 | 14 |
| 5287.0 | 14 |
| 5288.0 | 14 |
| 5289.0 | 14 |
| 5290.0 | 14 |
| 5291.0 | 14 |
| 5292.0 | 14 |
| 5293.0 | 14 |
| 5294.0 | 14 |
| 5295.0 | 14 |
| 5296.0 | 14 |
| 5297.0 | 14 |
| 5298.0 | 14 |
| 5299.0 | 14 |
| 5300.0 | 14 |
| 5301.0 | 14 |
| 5302.0 | 14 |
| 5303.0 | 14 |
| 5304.0 | 14 |
| 5305.0 | 14 |
| 5306.0 | 14 |
| 5307.0 | 14 |
| 5308.0 | 14 |
| 5309.0 | 14 |
| 5310.0 | 14 |
| 5311.0 | 14 |
| 5312.0 | 14 |
| 5313.0 | 14 |
| 5314.0 | 14 |
| 5315.0 | 14 |
| 5316.0 | 14 |
| 5317.0 | 14 |
| 5318.0 | 14 |
| 5319.0 | 14 |
| 5320.0 | 14 |
| 5321.0 | 14 |
| 5322.0 | 14 |
| 5323.0 | 14 |
| 5324.0 | 14 |
| 5325.0 | 14 |
| 5326.0 | 14 |
| 5327.0 | 14 |
| 5328.0 | 14 |
| 5329.0 | 14 |
| 5330.0 | 14 |
| 5331.0 | 14 |
| 5332.0 | 14 |
| 5333.0 | 14 |
| 5334.0 | 14 |
| 5335.0 | 14 |
| 5336.0 | 14 |
| 5337.0 | 14 |
| 5338.0 | 14 |
| 5339.0 | 14 |
| 5340.0 | 14 |
| 5341.0 | 14 |
| 5342.0 | 14 |
| 5343.0 | 14 |
| 5344.0 | 14 |
| 5345.0 | 14 |
| 5346.0 | 14 |
| 5347.0 | 14 |
| 5348.0 | 14 |
| 5349.0 | 14 |
| 5350.0 | 14 |
| 5351.0 | 14 |
| 5352.0 | 14 |
| 5353.0 | 14 |
| 5354.0 | 14 |
| 5355.0 | 14 |
| 5356.0 | 14 |
| 5357.0 | 14 |
| 5358.0 | 14 |
| 5359.0 | 14 |
| 5360.0 | 14 |
| 5361.0 | 14 |
| 5362.0 | 14 |
| 5363.0 | 14 |
| 5364.0 | 14 |
| 5365.0 | 14 |
| 5366.0 | 14 |
| 5367.0 | 14 |
| 5368.0 | 14 |
| 5369.0 | 14 |
| 5370.0 | 14 |
| 5371.0 | 14 |
| 5372.0 | 14 |
| 5373.0 | 14 |
| 5374.0 | 14 |
| 5375.0 | 14 |
| 5376.0 | 14 |
| 5377.0 | 14 |
| 5378.0 | 14 |
| 5379.0 | 14 |
| 5380.0 | 14 |
| 5381.0 | 14 |
| 5382.0 | 14 |
| 5383.0 | 14 |
| 5384.0 | 14 |
| 5385.0 | 14 |
| 5386.0 | 14 |
| 5387.0 | 14 |
| 5388.0 | 14 |
| 5389.0 | 14 |
| 5390.0 | 14 |
| 5391.0 | 14 |
| 5392.0 | 14 |
| 5393.0 | 14 |
| 5394.0 | 14 |
| 5395.0 | 14 |
| 5396.0 | 14 |
| 5397.0 | 14 |
| 5398.0 | 14 |
| 5399.0 | 14 |
| 5400.0 | 14 |
| 5401.0 | 14 |
| 5402.0 | 14 |
| 5403.0 | 14 |
| 5404.0 | 14 |
| 5405.0 | 14 |
| 5406.0 | 14 |
| 5407.0 | 14 |
| 5408.0 | 14 |
| 5409.0 | 14 |
| 5410.0 | 14 |
| 5411.0 | 14 |
| 5412.0 | 14 |
| 5413.0 | 14 |
| 5414.0 | 14 |
| 5415.0 | 14 |
| 5416.0 | 14 |
| 5417.0 | 14 |
| 5418.0 | 14 |
| 5419.0 | 14 |
| 5420.0 | 14 |
| 5421.0 | 14 |
| 5422.0 | 14 |
| 5423.0 | 14 |
| 5424.0 | 14 |
| 5425.0 | 14 |
| 5426.0 | 14 |
| 5427.0 | 14 |
| 5428.0 | 14 |
| 5429.0 | 14 |
| 5430.0 | 14 |
| 5431.0 | 14 |
| 5432.0 | 14 |
| 5433.0 | 14 |
| 5434.0 | 14 |
| 5435.0 | 14 |
| 5436.0 | 14 |
| 5437.0 | 14 |
| 5438.0 | 14 |
| 5439.0 | 14 |
| 5440.0 | 14 |
| 5441.0 | 14 |
| 5442.0 | 14 |
| 5443.0 | 14 |
| 5444.0 | 14 |
| 5445.0 | 14 |
| 5446.0 | 14 |
| 5447.0 | 14 |
| 5448.0 | 14 |
| 5449.0 | 14 |
| 5450.0 | 14 |
| 5451.0 | 14 |
| 5452.0 | 14 |
| 5453.0 | 14 |
| 5454.0 | 14 |
| 5455.0 | 14 |
| 5456.0 | 14 |
| 5457.0 | 14 |
| 5458.0 | 14 |
| 5459.0 | 14 |
| 5460.0 | 14 |
| 5461.0 | 14 |
| 5462.0 | 14 |
| 5463.0 | 14 |
| 5464.0 | 14 |
| 5465.0 | 14 |
| 5466.0 | 14 |
| 5467.0 | 14 |
| 5468.0 | 14 |
| 5469.0 | 14 |
| 5470.0 | 14 |
| 5471.0 | 14 |
| 5472.0 | 14 |
| 5473.0 | 14 |
| 5474.0 | 14 |
| 5475.0 | 14 |
| 5476.0 | 14 |
| 5477.0 | 14 |
| 5478.0 | 14 |
| 5479.0 | 14 |
| 5480.0 | 14 |
| 5481.0 | 14 |
| 5482.0 | 14 |
| 5483.0 | 14 |
| 5484.0 | 14 |
| 5485.0 | 14 |
| 5486.0 | 14 |
| 5487.0 | 14 |
| 5488.0 | 14 |
| 5489.0 | 14 |
| 5490.0 | 14 |
| 5491.0 | 14 |
| 5492.0 | 14 |
| 5493.0 | 14 |
| 5494.0 | 14 |
| 5495.0 | 14 |
| 5496.0 | 14 |
| 5497.0 | 14 |
| 5498.0 | 14 |
| 5499.0 | 14 |
| 5500.0 | 14 |
| 5501.0 | 14 |
| 5502.0 | 14 |
| 5503.0 | 14 |
| 5504.0 | 14 |
| 5505.0 | 14 |
| 5506.0 | 14 |
| 5507.0 | 14 |
| 5508.0 | 14 |
| 5509.0 | 14 |
| 5510.0 | 14 |
| 5511.0 | 14 |
| 5512.0 | 14 |
| 5513.0 | 14 |
| 5514.0 | 14 |
| 5515.0 | 14 |
| 5516.0 | 14 |
| 5517.0 | 14 |
| 5518.0 | 14 |
| 5519.0 | 14 |
| 5520.0 | 14 |
| 5521.0 | 14 |
| 5522.0 | 14 |
| 5523.0 | 14 |
| 5524.0 | 14 |
| 5525.0 | 14 |
| 5526.0 | 14 |
| 5527.0 | 14 |
| 5528.0 | 14 |
| 5529.0 | 14 |
| 5530.0 | 14 |
| 5531.0 | 14 |
| 5532.0 | 14 |
| 5533.0 | 14 |
| 5534.0 | 14 |
| 5535.0 | 14 |
| 5536.0 | 14 |
| 5537.0 | 14 |
| 5538.0 | 14 |
| 5539.0 | 14 |
| 5540.0 | 14 |
| 5541.0 | 14 |
| 5542.0 | 14 |
| 5543.0 | 14 |
| 5544.0 | 14 |
| 5545.0 | 14 |
| 5546.0 | 14 |
| 5547.0 | 14 |
| 5548.0 | 14 |
| 5549.0 | 14 |
| 5550.0 | 14 |
| 5551.0 | 14 |
| 5552.0 | 14 |
| 5553.0 | 14 |
| 5554.0 | 14 |
| 5555.0 | 14 |
| 5556.0 | 14 |
| 5557.0 | 14 |
| 5558.0 | 14 |
| 5559.0 | 14 |
| 5560.0 | 14 |
| 5561.0 | 14 |
| 5562.0 | 14 |
| 5563.0 | 14 |
| 5564.0 | 14 |
| 5565.0 | 14 |
| 5566.0 | 14 |
| 5567.0 | 14 |
| 5568.0 | 14 |
| 5569.0 | 14 |
| 5570.0 | 14 |
| 5571.0 | 14 |
| 5572.0 | 14 |
| 5573.0 | 14 |
| 5574.0 | 14 |
| 5575.0 | 14 |
| 5576.0 | 14 |
| 5577.0 | 14 |
| 5578.0 | 14 |
| 5579.0 | 14 |
| 5580.0 | 14 |
| 5581.0 | 14 |
| 5582.0 | 14 |
| 5583.0 | 14 |
| 5584.0 | 14 |
| 5585.0 | 14 |
| 5586.0 | 14 |
| 5587.0 | 14 |
| 5588.0 | 14 |
| 5589.0 | 14 |
| 5590.0 | 14 |
| 5591.0 | 14 |
| 5592.0 | 14 |
| 5593.0 | 14 |
| 5594.0 | 14 |
| 5595.0 | 14 |
| 5596.0 | 14 |
| 5597.0 | 14 |
| 5598.0 | 14 |
| 5599.0 | 14 |
| 5600.0 | 14 |
| 5601.0 | 14 |
| 5602.0 | 14 |
| 5603.0 | 14 |
| 5604.0 | 14 |
| 5605.0 | 14 |
| 5606.0 | 14 |
| 5607.0 | 14 |
| 5608.0 | 14 |
| 5609.0 | 14 |
| 5610.0 | 14 |
| 5611.0 | 14 |
| 5612.0 | 14 |
| 5613.0 | 14 |
| 5614.0 | 14 |
| 5615.0 | 14 |
| 5616.0 | 14 |
| 5617.0 | 14 |
| 5618.0 | 14 |
| 5619.0 | 14 |
| 5620.0 | 14 |
| 5621.0 | 14 |
| 5622.0 | 14 |
| 5623.0 | 14 |
| 5624.0 | 14 |
| 5625.0 | 14 |
| 5626.0 | 14 |
| 5627.0 | 14 |
| 5628.0 | 14 |
| 5629.0 | 14 |
| 5630.0 | 14 |
| 5631.0 | 14 |
| 5632.0 | 14 |
| 5633.0 | 14 |
| 5634.0 | 14 |
| 5635.0 | 14 |
| 5636.0 | 14 |
| 5637.0 | 14 |
| 5638.0 | 14 |
| 5639.0 | 14 |
| 5640.0 | 14 |
| 5641.0 | 14 |
| 5642.0 | 14 |
| 5643.0 | 14 |
| 5644.0 | 14 |
| 5645.0 | 14 |
| 5646.0 | 14 |
| 5647.0 | 14 |
| 5648.0 | 14 |
| 5649.0 | 14 |
| 5650.0 | 14 |
| 5651.0 | 14 |
| 5652.0 | 14 |
| 5653.0 | 14 |
| 5654.0 | 14 |
| 5655.0 | 14 |
| 5656.0 | 14 |
| 5657.0 | 14 |
| 5658.0 | 14 |
| 5659.0 | 14 |
| 5660.0 | 14 |
| 5661.0 | 14 |
| 5662.0 | 14 |
| 5663.0 | 14 |
| 5664.0 | 14 |
| 5665.0 | 14 |
| 5666.0 | 14 |
| 5667.0 | 14 |
| 5668.0 | 14 |
| 5669.0 | 14 |
| 5670.0 | 14 |
| 5671.0 | 14 |
| 5672.0 | 14 |
| 5673.0 | 14 |
| 5674.0 | 14 |
| 5675.0 | 14 |
| 5676.0 | 14 |
| 5677.0 | 14 |
| 5678.0 | 14 |
| 5679.0 | 14 |
| 5680.0 | 14 |
| 5681.0 | 14 |
| 5682.0 | 14 |
| 5683.0 | 14 |
| 5684.0 | 14 |
| 5685.0 | 14 |
| 5686.0 | 14 |
| 5687.0 | 14 |
| 5688.0 | 14 |
| 5689.0 | 14 |
| 5690.0 | 14 |
| 5691.0 | 14 |
| 5692.0 | 14 |
| 5693.0 | 14 |
| 5694.0 | 14 |
| 5695.0 | 14 |
| 5696.0 | 14 |
| 5697.0 | 14 |
| 5698.0 | 14 |
| 5699.0 | 14 |
| 5700.0 | 14 |
| 5701.0 | 14 |
| 5702.0 | 14 |
| 5703.0 | 14 |
| 5704.0 | 14 |
| 5705.0 | 14 |
| 5706.0 | 14 |
| 5707.0 | 14 |
| 5708.0 | 14 |
| 5709.0 | 14 |
| 5710.0 | 14 |
| 5711.0 | 14 |
| 5712.0 | 14 |
| 5713.0 | 14 |
| 5714.0 | 14 |
| 5715.0 | 14 |
| 5716.0 | 14 |
| 5717.0 | 14 |
| 5718.0 | 14 |
| 5719.0 | 14 |
| 5720.0 | 14 |
| 5721.0 | 14 |
| 5722.0 | 14 |
| 5723.0 | 14 |
| 5724.0 | 14 |
| 5725.0 | 14 |
| 5726.0 | 14 |
| 5727.0 | 14 |
| 5728.0 | 14 |
| 5729.0 | 14 |
| 5730.0 | 14 |
| 5731.0 | 14 |
| 5732.0 | 14 |
| 5733.0 | 14 |
| 5734.0 | 14 |
| 5735.0 | 14 |
| 5736.0 | 14 |
| 5737.0 | 14 |
| 5738.0 | 14 |
| 5739.0 | 14 |
| 5740.0 | 14 |
| 5741.0 | 14 |
| 5742.0 | 14 |
| 5743.0 | 14 |
| 5744.0 | 14 |
| 5745.0 | 14 |
| 5746.0 | 14 |
| 5747.0 | 14 |
| 5748.0 | 14 |
| 5749.0 | 14 |
| 5750.0 | 14 |
| 5751.0 | 14 |
| 5752.0 | 14 |
| 5753.0 | 14 |
| 5754.0 | 14 |
| 5755.0 | 14 |
| 5756.0 | 14 |
| 5757.0 | 14 |
| 5758.0 | 14 |
| 5759.0 | 14 |
| 5760.0 | 14 |
| 5761.0 | 14 |
| 5762.0 | 14 |
| 5763.0 | 14 |
| 5764.0 | 14 |
| 5765.0 | 14 |
| 5766.0 | 14 |
| 5767.0 | 14 |
| 5768.0 | 14 |
| 5769.0 | 14 |
| 5770.0 | 14 |
| 5771.0 | 14 |
| 5772.0 | 14 |
| 5773.0 | 14 |
| 5774.0 | 14 |
| 5775.0 | 14 |
| 5776.0 | 14 |
| 5777.0 | 14 |
| 5778.0 | 14 |
| 5779.0 | 14 |
| 5780.0 | 14 |
| 5781.0 | 14 |
| 5782.0 | 14 |
| 5783.0 | 14 |
| 5784.0 | 14 |
| 5785.0 | 14 |
| 5786.0 | 14 |
| 5787.0 | 14 |
| 5788.0 | 14 |
| 5789.0 | 14 |
| 5790.0 | 14 |
| 5791.0 | 14 |
| 5792.0 | 14 |
| 5793.0 | 14 |
| 5794.0 | 14 |
| 5795.0 | 14 |
| 5796.0 | 14 |
| 5797.0 | 14 |
| 5798.0 | 14 |
| 5799.0 | 14 |
| 5800.0 | 14 |
| 5801.0 | 14 |
| 5802.0 | 14 |
| 5803.0 | 14 |
| 5804.0 | 14 |
| 5805.0 | 14 |
| 5806.0 | 14 |
| 5807.0 | 14 |
| 5808.0 | 14 |
| 5809.0 | 14 |
| 5810.0 | 14 |
| 5811.0 | 14 |
| 5812.0 | 14 |
| 5813.0 | 14 |
| 5814.0 | 14 |
| 5815.0 | 14 |
| 5816.0 | 14 |
| 5817.0 | 14 |
| 5818.0 | 14 |
| 5819.0 | 14 |
| 5820.0 | 14 |
| 5821.0 | 14 |
| 5822.0 | 14 |
| 5823.0 | 14 |
| 5824.0 | 14 |
| 5825.0 | 14 |
| 5826.0 | 14 |
| 5827.0 | 14 |
| 5828.0 | 14 |
| 5829.0 | 14 |
| 5830.0 | 14 |
| 5831.0 | 14 |
| 5832.0 | 14 |
| 5833.0 | 14 |
| 5834.0 | 14 |
| 5835.0 | 14 |
| 5836.0 | 14 |
| 5837.0 | 14 |
| 5838.0 | 14 |
| 5839.0 | 14 |
| 5840.0 | 14 |
| 5841.0 | 14 |
| 5842.0 | 14 |
| 5843.0 | 14 |
| 5844.0 | 14 |
| 5845.0 | 14 |
| 5846.0 | 14 |
| 5847.0 | 14 |
| 5848.0 | 14 |
| 5849.0 | 14 |
| 5850.0 | 14 |
| 5851.0 | 14 |
| 5852.0 | 14 |
| 5853.0 | 14 |
| 5854.0 | 14 |
| 5855.0 | 14 |
| 5856.0 | 14 |
| 5857.0 | 14 |
| 5858.0 | 14 |
| 5859.0 | 14 |
| 5860.0 | 14 |
| 5861.0 | 14 |
| 5862.0 | 14 |
| 5863.0 | 14 |
| 5864.0 | 14 |
| 5865.0 | 14 |
| 5866.0 | 14 |
| 5867.0 | 14 |
| 5868.0 | 14 |
| 5869.0 | 14 |
| 5870.0 | 14 |
| 5871.0 | 14 |
| 5872.0 | 14 |
| 5873.0 | 14 |
| 5874.0 | 14 |
| 5875.0 | 14 |
| 5876.0 | 14 |
| 5877.0 | 14 |
| 5878.0 | 14 |
| 5879.0 | 14 |
| 5880.0 | 14 |
| 5881.0 | 14 |
| 5882.0 | 14 |
| 5883.0 | 14 |
| 5884.0 | 14 |
| 5885.0 | 14 |
| 5886.0 | 14 |
| 5887.0 | 14 |
| 5888.0 | 14 |
| 5889.0 | 14 |
| 5890.0 | 14 |
| 5891.0 | 14 |
| 5892.0 | 14 |
| 5893.0 | 14 |
| 5894.0 | 14 |
| 5895.0 | 14 |
| 5896.0 | 14 |
| 5897.0 | 14 |
| 5898.0 | 14 |
| 5899.0 | 14 |
| 5900.0 | 14 |
| 5901.0 | 14 |
| 5902.0 | 14 |
| 5903.0 | 14 |
| 5904.0 | 14 |
| 5905.0 | 14 |
| 5906.0 | 14 |
| 5907.0 | 14 |
| 5908.0 | 14 |
| 5909.0 | 14 |
| 5910.0 | 14 |
| 5911.0 | 14 |
| 5912.0 | 14 |
| 5913.0 | 14 |
| 5914.0 | 14 |
| 5915.0 | 14 |
| 5916.0 | 14 |
| 5917.0 | 14 |
| 5918.0 | 14 |
| 5919.0 | 14 |
| 5920.0 | 14 |
| 5921.0 | 14 |
| 5922.0 | 14 |
| 5923.0 | 14 |
| 5924.0 | 14 |
| 5925.0 | 14 |
| 5926.0 | 14 |
| 5927.0 | 14 |
| 5928.0 | 14 |
| 5929.0 | 14 |
| 5930.0 | 14 |
| 5931.0 | 14 |
| 5932.0 | 14 |
| 5933.0 | 14 |
| 5934.0 | 14 |
| 5935.0 | 14 |
| 5936.0 | 14 |
| 5937.0 | 14 |
| 5938.0 | 14 |
| 5939.0 | 14 |
| 5940.0 | 14 |
| 5941.0 | 14 |
| 5942.0 | 14 |
| 5943.0 | 14 |
| 5944.0 | 14 |
| 5945.0 | 14 |
| 5946.0 | 14 |
| 5947.0 | 14 |
| 5948.0 | 14 |
| 5949.0 | 14 |
| 5950.0 | 14 |
| 5951.0 | 14 |
| 5952.0 | 14 |
| 5953.0 | 14 |
| 5954.0 | 14 |
| 5955.0 | 14 |
| 5956.0 | 14 |
| 5957.0 | 14 |
| 5958.0 | 14 |
| 5959.0 | 14 |
| 5960.0 | 14 |
| 5961.0 | 14 |
| 5962.0 | 14 |
| 5963.0 | 14 |
| 5964.0 | 14 |
| 5965.0 | 14 |
| 5966.0 | 14 |
| 5967.0 | 14 |
| 5968.0 | 14 |
| 5969.0 | 14 |
| 5970.0 | 14 |
| 5971.0 | 14 |
| 5972.0 | 14 |
| 5973.0 | 14 |
| 5974.0 | 14 |
| 5975.0 | 14 |
| 5976.0 | 14 |
| 5977.0 | 14 |
| 5978.0 | 14 |
| 5979.0 | 14 |
| 5980.0 | 14 |
| 5981.0 | 14 |
| 5982.0 | 14 |
| 5983.0 | 14 |
| 5984.0 | 14 |
| 5985.0 | 14 |
| 5986.0 | 14 |
| 5987.0 | 14 |
| 5988.0 | 14 |
| 5989.0 | 14 |
| 5990.0 | 14 |
| 5991.0 | 14 |
| 5992.0 | 14 |
| 5993.0 | 14 |
| 5994.0 | 14 |
| 5995.0 | 14 |
| 5996.0 | 14 |
| 5997.0 | 14 |
| 5998.0 | 14 |
| 5999.0 | 14 |
| 6000.0 | 14 |